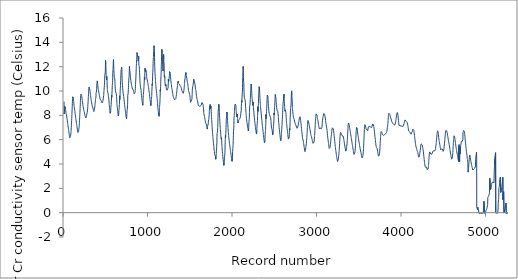
| Category | Series 0 |
|---|---|
| 0.0 | 9.13 |
| 1.0 | 8.11 |
| 2.0 | 8.12 |
| 3.0 | 8.24 |
| 4.0 | 8.34 |
| 5.0 | 8.43 |
| 6.0 | 8.53 |
| 7.0 | 8.64 |
| 8.0 | 8.74 |
| 9.0 | 8.79 |
| 10.0 | 8.8 |
| 11.0 | 8.8 |
| 12.0 | 8.8 |
| 13.0 | 8.81 |
| 14.0 | 8.75 |
| 15.0 | 8.69 |
| 16.0 | 8.62 |
| 17.0 | 8.54 |
| 18.0 | 8.47 |
| 19.0 | 8.41 |
| 20.0 | 8.36 |
| 21.0 | 8.31 |
| 22.0 | 8.27 |
| 23.0 | 8.22 |
| 24.0 | 8.17 |
| 25.0 | 8.13 |
| 26.0 | 8.09 |
| 27.0 | 8.06 |
| 28.0 | 8.04 |
| 29.0 | 8.02 |
| 30.0 | 7.988 |
| 31.0 | 7.944 |
| 32.0 | 7.908 |
| 33.0 | 7.854 |
| 34.0 | 7.809 |
| 35.0 | 7.75 |
| 36.0 | 7.708 |
| 37.0 | 7.666 |
| 38.0 | 7.603 |
| 39.0 | 7.549 |
| 40.0 | 7.488 |
| 41.0 | 7.438 |
| 42.0 | 7.386 |
| 43.0 | 7.335 |
| 44.0 | 7.281 |
| 45.0 | 7.234 |
| 46.0 | 7.182 |
| 47.0 | 7.139 |
| 48.0 | 7.087 |
| 49.0 | 7.037 |
| 50.0 | 6.991 |
| 51.0 | 6.939 |
| 52.0 | 6.896 |
| 53.0 | 6.842 |
| 54.0 | 6.794 |
| 55.0 | 6.744 |
| 56.0 | 6.694 |
| 57.0 | 6.647 |
| 58.0 | 6.595 |
| 59.0 | 6.545 |
| 60.0 | 6.49 |
| 61.0 | 6.443 |
| 62.0 | 6.395 |
| 63.0 | 6.35 |
| 64.0 | 6.312 |
| 65.0 | 6.262 |
| 66.0 | 6.223 |
| 67.0 | 6.186 |
| 68.0 | 6.16 |
| 69.0 | 6.16 |
| 70.0 | 6.172 |
| 71.0 | 6.181 |
| 72.0 | 6.196 |
| 73.0 | 6.212 |
| 74.0 | 6.226 |
| 75.0 | 6.257 |
| 76.0 | 6.282 |
| 77.0 | 6.329 |
| 78.0 | 6.375 |
| 79.0 | 6.409 |
| 80.0 | 6.458 |
| 81.0 | 6.529 |
| 82.0 | 6.588 |
| 83.0 | 6.674 |
| 84.0 | 6.769 |
| 85.0 | 6.883 |
| 86.0 | 7.012 |
| 87.0 | 7.163 |
| 88.0 | 7.299 |
| 89.0 | 7.438 |
| 90.0 | 7.58 |
| 91.0 | 7.737 |
| 92.0 | 7.875 |
| 93.0 | 8.04 |
| 94.0 | 8.2 |
| 95.0 | 8.35 |
| 96.0 | 8.53 |
| 97.0 | 8.75 |
| 98.0 | 8.97 |
| 99.0 | 9.13 |
| 100.0 | 9.18 |
| 101.0 | 9.27 |
| 102.0 | 9.4 |
| 103.0 | 9.52 |
| 104.0 | 9.56 |
| 105.0 | 9.56 |
| 106.0 | 9.56 |
| 107.0 | 9.52 |
| 108.0 | 9.48 |
| 109.0 | 9.43 |
| 110.0 | 9.34 |
| 111.0 | 9.29 |
| 112.0 | 9.21 |
| 113.0 | 9.14 |
| 114.0 | 9.12 |
| 115.0 | 9.07 |
| 116.0 | 8.98 |
| 117.0 | 8.91 |
| 118.0 | 8.84 |
| 119.0 | 8.78 |
| 120.0 | 8.72 |
| 121.0 | 8.67 |
| 122.0 | 8.62 |
| 123.0 | 8.6 |
| 124.0 | 8.55 |
| 125.0 | 8.51 |
| 126.0 | 8.46 |
| 127.0 | 8.4 |
| 128.0 | 8.35 |
| 129.0 | 8.29 |
| 130.0 | 8.22 |
| 131.0 | 8.16 |
| 132.0 | 8.1 |
| 133.0 | 8.05 |
| 134.0 | 8 |
| 135.0 | 7.948 |
| 136.0 | 7.894 |
| 137.0 | 7.843 |
| 138.0 | 7.791 |
| 139.0 | 7.737 |
| 140.0 | 7.689 |
| 141.0 | 7.639 |
| 142.0 | 7.583 |
| 143.0 | 7.539 |
| 144.0 | 7.493 |
| 145.0 | 7.445 |
| 146.0 | 7.396 |
| 147.0 | 7.348 |
| 148.0 | 7.301 |
| 149.0 | 7.252 |
| 150.0 | 7.21 |
| 151.0 | 7.164 |
| 152.0 | 7.117 |
| 153.0 | 7.064 |
| 154.0 | 7.015 |
| 155.0 | 6.964 |
| 156.0 | 6.918 |
| 157.0 | 6.871 |
| 158.0 | 6.824 |
| 159.0 | 6.779 |
| 160.0 | 6.728 |
| 161.0 | 6.687 |
| 162.0 | 6.646 |
| 163.0 | 6.614 |
| 164.0 | 6.591 |
| 165.0 | 6.585 |
| 166.0 | 6.59 |
| 167.0 | 6.611 |
| 168.0 | 6.629 |
| 169.0 | 6.647 |
| 170.0 | 6.665 |
| 171.0 | 6.697 |
| 172.0 | 6.726 |
| 173.0 | 6.765 |
| 174.0 | 6.817 |
| 175.0 | 6.837 |
| 176.0 | 6.905 |
| 177.0 | 6.972 |
| 178.0 | 7.02 |
| 179.0 | 7.103 |
| 180.0 | 7.19 |
| 181.0 | 7.3 |
| 182.0 | 7.421 |
| 183.0 | 7.563 |
| 184.0 | 7.691 |
| 185.0 | 7.826 |
| 186.0 | 7.96 |
| 187.0 | 8.08 |
| 188.0 | 8.21 |
| 189.0 | 8.35 |
| 190.0 | 8.54 |
| 191.0 | 8.72 |
| 192.0 | 8.85 |
| 193.0 | 9.04 |
| 194.0 | 9.22 |
| 195.0 | 9.36 |
| 196.0 | 9.5 |
| 197.0 | 9.56 |
| 198.0 | 9.63 |
| 199.0 | 9.66 |
| 200.0 | 9.74 |
| 201.0 | 9.7 |
| 202.0 | 9.72 |
| 203.0 | 9.73 |
| 204.0 | 9.72 |
| 205.0 | 9.69 |
| 206.0 | 9.68 |
| 207.0 | 9.65 |
| 208.0 | 9.6 |
| 209.0 | 9.57 |
| 210.0 | 9.53 |
| 211.0 | 9.46 |
| 212.0 | 9.41 |
| 213.0 | 9.37 |
| 214.0 | 9.32 |
| 215.0 | 9.26 |
| 216.0 | 9.21 |
| 217.0 | 9.16 |
| 218.0 | 9.11 |
| 219.0 | 9.06 |
| 220.0 | 9.01 |
| 221.0 | 8.95 |
| 222.0 | 8.91 |
| 223.0 | 8.86 |
| 224.0 | 8.82 |
| 225.0 | 8.77 |
| 226.0 | 8.72 |
| 227.0 | 8.68 |
| 228.0 | 8.64 |
| 229.0 | 8.6 |
| 230.0 | 8.56 |
| 231.0 | 8.52 |
| 232.0 | 8.49 |
| 233.0 | 8.45 |
| 234.0 | 8.43 |
| 235.0 | 8.4 |
| 236.0 | 8.37 |
| 237.0 | 8.34 |
| 238.0 | 8.31 |
| 239.0 | 8.28 |
| 240.0 | 8.25 |
| 241.0 | 8.23 |
| 242.0 | 8.2 |
| 243.0 | 8.16 |
| 244.0 | 8.13 |
| 245.0 | 8.1 |
| 246.0 | 8.06 |
| 247.0 | 8.02 |
| 248.0 | 7.99 |
| 249.0 | 7.968 |
| 250.0 | 7.947 |
| 251.0 | 7.91 |
| 252.0 | 7.874 |
| 253.0 | 7.848 |
| 254.0 | 7.821 |
| 255.0 | 7.802 |
| 256.0 | 7.794 |
| 257.0 | 7.782 |
| 258.0 | 7.767 |
| 259.0 | 7.765 |
| 260.0 | 7.771 |
| 261.0 | 7.803 |
| 262.0 | 7.822 |
| 263.0 | 7.839 |
| 264.0 | 7.863 |
| 265.0 | 7.899 |
| 266.0 | 7.945 |
| 267.0 | 7.993 |
| 268.0 | 8.02 |
| 269.0 | 8.06 |
| 270.0 | 8.1 |
| 271.0 | 8.12 |
| 272.0 | 8.18 |
| 273.0 | 8.22 |
| 274.0 | 8.23 |
| 275.0 | 8.24 |
| 276.0 | 8.3 |
| 277.0 | 8.36 |
| 278.0 | 8.38 |
| 279.0 | 8.43 |
| 280.0 | 8.57 |
| 281.0 | 8.73 |
| 282.0 | 8.89 |
| 283.0 | 8.93 |
| 284.0 | 9.02 |
| 285.0 | 9.15 |
| 286.0 | 9.28 |
| 287.0 | 9.44 |
| 288.0 | 9.55 |
| 289.0 | 9.68 |
| 290.0 | 9.8 |
| 291.0 | 9.94 |
| 292.0 | 10.07 |
| 293.0 | 10.15 |
| 294.0 | 10.22 |
| 295.0 | 10.27 |
| 296.0 | 10.3 |
| 297.0 | 10.31 |
| 298.0 | 10.29 |
| 299.0 | 10.26 |
| 300.0 | 10.22 |
| 301.0 | 10.24 |
| 302.0 | 10.27 |
| 303.0 | 10.29 |
| 304.0 | 10.23 |
| 305.0 | 10.17 |
| 306.0 | 10.08 |
| 307.0 | 10 |
| 308.0 | 9.95 |
| 309.0 | 9.89 |
| 310.0 | 9.84 |
| 311.0 | 9.78 |
| 312.0 | 9.72 |
| 313.0 | 9.67 |
| 314.0 | 9.61 |
| 315.0 | 9.56 |
| 316.0 | 9.51 |
| 317.0 | 9.45 |
| 318.0 | 9.4 |
| 319.0 | 9.35 |
| 320.0 | 9.31 |
| 321.0 | 9.26 |
| 322.0 | 9.21 |
| 323.0 | 9.17 |
| 324.0 | 9.12 |
| 325.0 | 9.08 |
| 326.0 | 9.05 |
| 327.0 | 9.01 |
| 328.0 | 8.97 |
| 329.0 | 8.94 |
| 330.0 | 8.9 |
| 331.0 | 8.86 |
| 332.0 | 8.83 |
| 333.0 | 8.79 |
| 334.0 | 8.76 |
| 335.0 | 8.75 |
| 336.0 | 8.73 |
| 337.0 | 8.7 |
| 338.0 | 8.67 |
| 339.0 | 8.65 |
| 340.0 | 8.63 |
| 341.0 | 8.61 |
| 342.0 | 8.59 |
| 343.0 | 8.56 |
| 344.0 | 8.53 |
| 345.0 | 8.5 |
| 346.0 | 8.47 |
| 347.0 | 8.44 |
| 348.0 | 8.4 |
| 349.0 | 8.38 |
| 350.0 | 8.36 |
| 351.0 | 8.34 |
| 352.0 | 8.32 |
| 353.0 | 8.31 |
| 354.0 | 8.29 |
| 355.0 | 8.29 |
| 356.0 | 8.31 |
| 357.0 | 8.37 |
| 358.0 | 8.4 |
| 359.0 | 8.42 |
| 360.0 | 8.49 |
| 361.0 | 8.54 |
| 362.0 | 8.6 |
| 363.0 | 8.67 |
| 364.0 | 8.69 |
| 365.0 | 8.79 |
| 366.0 | 8.84 |
| 367.0 | 8.89 |
| 368.0 | 8.99 |
| 369.0 | 9.08 |
| 370.0 | 9.13 |
| 371.0 | 9.16 |
| 372.0 | 9.23 |
| 373.0 | 9.32 |
| 374.0 | 9.33 |
| 375.0 | 9.34 |
| 376.0 | 9.41 |
| 377.0 | 9.5 |
| 378.0 | 9.61 |
| 379.0 | 9.81 |
| 380.0 | 9.8 |
| 381.0 | 9.9 |
| 382.0 | 9.94 |
| 383.0 | 9.9 |
| 384.0 | 10 |
| 385.0 | 10.09 |
| 386.0 | 10.18 |
| 387.0 | 10.33 |
| 388.0 | 10.48 |
| 389.0 | 10.6 |
| 390.0 | 10.68 |
| 391.0 | 10.71 |
| 392.0 | 10.77 |
| 393.0 | 10.73 |
| 394.0 | 10.83 |
| 395.0 | 10.74 |
| 396.0 | 10.64 |
| 397.0 | 10.62 |
| 398.0 | 10.57 |
| 399.0 | 10.51 |
| 400.0 | 10.45 |
| 401.0 | 10.37 |
| 402.0 | 10.31 |
| 403.0 | 10.24 |
| 404.0 | 10.17 |
| 405.0 | 10.12 |
| 406.0 | 10.08 |
| 407.0 | 10.04 |
| 408.0 | 10.02 |
| 409.0 | 9.98 |
| 410.0 | 9.95 |
| 411.0 | 9.91 |
| 412.0 | 9.88 |
| 413.0 | 9.85 |
| 414.0 | 9.82 |
| 415.0 | 9.78 |
| 416.0 | 9.73 |
| 417.0 | 9.7 |
| 418.0 | 9.66 |
| 419.0 | 9.61 |
| 420.0 | 9.57 |
| 421.0 | 9.54 |
| 422.0 | 9.52 |
| 423.0 | 9.48 |
| 424.0 | 9.43 |
| 425.0 | 9.38 |
| 426.0 | 9.33 |
| 427.0 | 9.32 |
| 428.0 | 9.31 |
| 429.0 | 9.31 |
| 430.0 | 9.3 |
| 431.0 | 9.3 |
| 432.0 | 9.3 |
| 433.0 | 9.29 |
| 434.0 | 9.29 |
| 435.0 | 9.28 |
| 436.0 | 9.26 |
| 437.0 | 9.25 |
| 438.0 | 9.23 |
| 439.0 | 9.2 |
| 440.0 | 9.17 |
| 441.0 | 9.15 |
| 442.0 | 9.15 |
| 443.0 | 9.14 |
| 444.0 | 9.12 |
| 445.0 | 9.09 |
| 446.0 | 9.08 |
| 447.0 | 9.08 |
| 448.0 | 9.07 |
| 449.0 | 9.06 |
| 450.0 | 9.02 |
| 451.0 | 8.99 |
| 452.0 | 9 |
| 453.0 | 9.02 |
| 454.0 | 9.04 |
| 455.0 | 9.09 |
| 456.0 | 9.1 |
| 457.0 | 9.11 |
| 458.0 | 9.13 |
| 459.0 | 9.16 |
| 460.0 | 9.18 |
| 461.0 | 9.21 |
| 462.0 | 9.29 |
| 463.0 | 9.34 |
| 464.0 | 9.43 |
| 465.0 | 9.49 |
| 466.0 | 9.43 |
| 467.0 | 9.44 |
| 468.0 | 9.51 |
| 469.0 | 9.62 |
| 470.0 | 9.74 |
| 471.0 | 9.84 |
| 472.0 | 9.94 |
| 473.0 | 10.06 |
| 474.0 | 10.08 |
| 475.0 | 10.13 |
| 476.0 | 10.31 |
| 477.0 | 10.45 |
| 478.0 | 10.57 |
| 479.0 | 10.67 |
| 480.0 | 10.83 |
| 481.0 | 10.98 |
| 482.0 | 11.25 |
| 483.0 | 11.36 |
| 484.0 | 11.39 |
| 485.0 | 11.41 |
| 486.0 | 11.42 |
| 487.0 | 11.5 |
| 488.0 | 11.57 |
| 489.0 | 11.7 |
| 490.0 | 12.13 |
| 491.0 | 12.51 |
| 492.0 | 12.58 |
| 493.0 | 12.48 |
| 494.0 | 12.25 |
| 495.0 | 12 |
| 496.0 | 11.72 |
| 497.0 | 11.58 |
| 498.0 | 11.39 |
| 499.0 | 11.28 |
| 500.0 | 11.19 |
| 501.0 | 11.14 |
| 502.0 | 11.06 |
| 503.0 | 10.91 |
| 504.0 | 11 |
| 505.0 | 11.21 |
| 506.0 | 11.21 |
| 507.0 | 11.2 |
| 508.0 | 11.1 |
| 509.0 | 10.75 |
| 510.0 | 10.49 |
| 511.0 | 10.32 |
| 512.0 | 10.21 |
| 513.0 | 10.12 |
| 514.0 | 10.03 |
| 515.0 | 9.97 |
| 516.0 | 9.92 |
| 517.0 | 9.86 |
| 518.0 | 9.84 |
| 519.0 | 9.86 |
| 520.0 | 9.87 |
| 521.0 | 9.84 |
| 522.0 | 9.78 |
| 523.0 | 9.71 |
| 524.0 | 9.65 |
| 525.0 | 9.58 |
| 526.0 | 9.52 |
| 527.0 | 9.48 |
| 528.0 | 9.47 |
| 529.0 | 9.42 |
| 530.0 | 9.35 |
| 531.0 | 9.25 |
| 532.0 | 9.18 |
| 533.0 | 9.1 |
| 534.0 | 8.99 |
| 535.0 | 8.89 |
| 536.0 | 8.8 |
| 537.0 | 8.74 |
| 538.0 | 8.67 |
| 539.0 | 8.62 |
| 540.0 | 8.58 |
| 541.0 | 8.5 |
| 542.0 | 8.42 |
| 543.0 | 8.35 |
| 544.0 | 8.27 |
| 545.0 | 8.22 |
| 546.0 | 8.17 |
| 547.0 | 8.16 |
| 548.0 | 8.16 |
| 549.0 | 8.15 |
| 550.0 | 8.19 |
| 551.0 | 8.28 |
| 552.0 | 8.42 |
| 553.0 | 8.54 |
| 554.0 | 8.64 |
| 555.0 | 8.71 |
| 556.0 | 8.75 |
| 557.0 | 8.81 |
| 558.0 | 8.88 |
| 559.0 | 9.11 |
| 560.0 | 9.18 |
| 561.0 | 9.26 |
| 562.0 | 9.63 |
| 563.0 | 9.57 |
| 564.0 | 9.48 |
| 565.0 | 9.54 |
| 566.0 | 9.65 |
| 567.0 | 9.78 |
| 568.0 | 9.93 |
| 569.0 | 10.12 |
| 570.0 | 10.26 |
| 571.0 | 10.45 |
| 572.0 | 10.56 |
| 573.0 | 10.62 |
| 574.0 | 10.7 |
| 575.0 | 10.87 |
| 576.0 | 11.12 |
| 577.0 | 11.49 |
| 578.0 | 11.67 |
| 579.0 | 11.67 |
| 580.0 | 11.77 |
| 581.0 | 11.85 |
| 582.0 | 12.06 |
| 583.0 | 12.33 |
| 584.0 | 12.46 |
| 585.0 | 12.58 |
| 586.0 | 12.46 |
| 587.0 | 12.21 |
| 588.0 | 11.95 |
| 589.0 | 11.78 |
| 590.0 | 11.65 |
| 591.0 | 11.56 |
| 592.0 | 11.44 |
| 593.0 | 11.35 |
| 594.0 | 11.22 |
| 595.0 | 11.08 |
| 596.0 | 11.03 |
| 597.0 | 11.07 |
| 598.0 | 11.07 |
| 599.0 | 11.04 |
| 600.0 | 11.02 |
| 601.0 | 10.99 |
| 602.0 | 10.8 |
| 603.0 | 10.61 |
| 604.0 | 10.47 |
| 605.0 | 10.35 |
| 606.0 | 10.23 |
| 607.0 | 10.15 |
| 608.0 | 10.06 |
| 609.0 | 9.99 |
| 610.0 | 9.92 |
| 611.0 | 9.87 |
| 612.0 | 9.84 |
| 613.0 | 9.92 |
| 614.0 | 9.96 |
| 615.0 | 9.9 |
| 616.0 | 9.85 |
| 617.0 | 9.82 |
| 618.0 | 9.79 |
| 619.0 | 9.75 |
| 620.0 | 9.68 |
| 621.0 | 9.55 |
| 622.0 | 9.44 |
| 623.0 | 9.31 |
| 624.0 | 9.18 |
| 625.0 | 9.07 |
| 626.0 | 8.98 |
| 627.0 | 8.89 |
| 628.0 | 8.8 |
| 629.0 | 8.73 |
| 630.0 | 8.67 |
| 631.0 | 8.61 |
| 632.0 | 8.54 |
| 633.0 | 8.48 |
| 634.0 | 8.42 |
| 635.0 | 8.36 |
| 636.0 | 8.3 |
| 637.0 | 8.24 |
| 638.0 | 8.18 |
| 639.0 | 8.12 |
| 640.0 | 8.06 |
| 641.0 | 8 |
| 642.0 | 7.958 |
| 643.0 | 7.922 |
| 644.0 | 7.882 |
| 645.0 | 7.876 |
| 646.0 | 7.949 |
| 647.0 | 8.1 |
| 648.0 | 8.27 |
| 649.0 | 8.4 |
| 650.0 | 8.46 |
| 651.0 | 8.5 |
| 652.0 | 8.55 |
| 653.0 | 8.65 |
| 654.0 | 8.72 |
| 655.0 | 8.89 |
| 656.0 | 9.01 |
| 657.0 | 9.08 |
| 658.0 | 9.6 |
| 659.0 | 9.44 |
| 660.0 | 9.3 |
| 661.0 | 9.39 |
| 662.0 | 9.47 |
| 663.0 | 9.68 |
| 664.0 | 9.91 |
| 665.0 | 10.06 |
| 666.0 | 10.23 |
| 667.0 | 10.32 |
| 668.0 | 10.45 |
| 669.0 | 10.66 |
| 670.0 | 10.86 |
| 671.0 | 11.04 |
| 672.0 | 11.26 |
| 673.0 | 11.43 |
| 674.0 | 11.55 |
| 675.0 | 11.65 |
| 676.0 | 11.72 |
| 677.0 | 11.77 |
| 678.0 | 11.84 |
| 679.0 | 11.87 |
| 680.0 | 11.92 |
| 681.0 | 11.97 |
| 682.0 | 11.94 |
| 683.0 | 11.86 |
| 684.0 | 11.76 |
| 685.0 | 11.57 |
| 686.0 | 11.3 |
| 687.0 | 11.07 |
| 688.0 | 10.93 |
| 689.0 | 10.8 |
| 690.0 | 10.67 |
| 691.0 | 10.55 |
| 692.0 | 10.42 |
| 693.0 | 10.32 |
| 694.0 | 10.23 |
| 695.0 | 10.15 |
| 696.0 | 10.08 |
| 697.0 | 10.01 |
| 698.0 | 9.93 |
| 699.0 | 9.85 |
| 700.0 | 9.79 |
| 701.0 | 9.74 |
| 702.0 | 9.74 |
| 703.0 | 9.72 |
| 704.0 | 9.67 |
| 705.0 | 9.62 |
| 706.0 | 9.55 |
| 707.0 | 9.48 |
| 708.0 | 9.41 |
| 709.0 | 9.36 |
| 710.0 | 9.29 |
| 711.0 | 9.23 |
| 712.0 | 9.17 |
| 713.0 | 9.09 |
| 714.0 | 9.03 |
| 715.0 | 8.96 |
| 716.0 | 8.89 |
| 717.0 | 8.85 |
| 718.0 | 8.78 |
| 719.0 | 8.72 |
| 720.0 | 8.66 |
| 721.0 | 8.61 |
| 722.0 | 8.57 |
| 723.0 | 8.51 |
| 724.0 | 8.45 |
| 725.0 | 8.4 |
| 726.0 | 8.34 |
| 727.0 | 8.29 |
| 728.0 | 8.23 |
| 729.0 | 8.17 |
| 730.0 | 8.12 |
| 731.0 | 8.08 |
| 732.0 | 8.03 |
| 733.0 | 7.976 |
| 734.0 | 7.924 |
| 735.0 | 7.872 |
| 736.0 | 7.816 |
| 737.0 | 7.778 |
| 738.0 | 7.744 |
| 739.0 | 7.719 |
| 740.0 | 7.751 |
| 741.0 | 7.834 |
| 742.0 | 7.938 |
| 743.0 | 8.07 |
| 744.0 | 8.16 |
| 745.0 | 8.28 |
| 746.0 | 8.37 |
| 747.0 | 8.44 |
| 748.0 | 8.49 |
| 749.0 | 8.54 |
| 750.0 | 8.57 |
| 751.0 | 8.69 |
| 752.0 | 8.87 |
| 753.0 | 9.07 |
| 754.0 | 9.63 |
| 755.0 | 9.71 |
| 756.0 | 9.61 |
| 757.0 | 9.63 |
| 758.0 | 9.69 |
| 759.0 | 9.82 |
| 760.0 | 9.99 |
| 761.0 | 10.14 |
| 762.0 | 10.29 |
| 763.0 | 10.46 |
| 764.0 | 10.63 |
| 765.0 | 10.74 |
| 766.0 | 10.89 |
| 767.0 | 11.03 |
| 768.0 | 11.07 |
| 769.0 | 11.09 |
| 770.0 | 11.22 |
| 771.0 | 11.39 |
| 772.0 | 11.57 |
| 773.0 | 11.74 |
| 774.0 | 12.02 |
| 775.0 | 11.95 |
| 776.0 | 11.7 |
| 777.0 | 11.7 |
| 778.0 | 11.69 |
| 779.0 | 11.64 |
| 780.0 | 11.59 |
| 781.0 | 11.51 |
| 782.0 | 11.43 |
| 783.0 | 11.37 |
| 784.0 | 11.31 |
| 785.0 | 11.21 |
| 786.0 | 11.13 |
| 787.0 | 11.08 |
| 788.0 | 10.98 |
| 789.0 | 10.93 |
| 790.0 | 10.89 |
| 791.0 | 10.84 |
| 792.0 | 10.79 |
| 793.0 | 10.75 |
| 794.0 | 10.72 |
| 795.0 | 10.65 |
| 796.0 | 10.59 |
| 797.0 | 10.55 |
| 798.0 | 10.51 |
| 799.0 | 10.49 |
| 800.0 | 10.46 |
| 801.0 | 10.43 |
| 802.0 | 10.4 |
| 803.0 | 10.36 |
| 804.0 | 10.33 |
| 805.0 | 10.3 |
| 806.0 | 10.26 |
| 807.0 | 10.24 |
| 808.0 | 10.22 |
| 809.0 | 10.21 |
| 810.0 | 10.2 |
| 811.0 | 10.18 |
| 812.0 | 10.16 |
| 813.0 | 10.17 |
| 814.0 | 10.15 |
| 815.0 | 10.14 |
| 816.0 | 10.12 |
| 817.0 | 10.1 |
| 818.0 | 10.1 |
| 819.0 | 10.09 |
| 820.0 | 10.07 |
| 821.0 | 10.03 |
| 822.0 | 9.99 |
| 823.0 | 9.96 |
| 824.0 | 9.92 |
| 825.0 | 9.9 |
| 826.0 | 9.88 |
| 827.0 | 9.86 |
| 828.0 | 9.85 |
| 829.0 | 9.83 |
| 830.0 | 9.8 |
| 831.0 | 9.77 |
| 832.0 | 9.73 |
| 833.0 | 9.69 |
| 834.0 | 9.69 |
| 835.0 | 9.7 |
| 836.0 | 9.73 |
| 837.0 | 9.77 |
| 838.0 | 9.84 |
| 839.0 | 9.87 |
| 840.0 | 9.88 |
| 841.0 | 9.91 |
| 842.0 | 9.96 |
| 843.0 | 10.05 |
| 844.0 | 10.22 |
| 845.0 | 10.35 |
| 846.0 | 10.53 |
| 847.0 | 10.72 |
| 848.0 | 10.75 |
| 849.0 | 10.77 |
| 850.0 | 11.06 |
| 851.0 | 11.31 |
| 852.0 | 11.4 |
| 853.0 | 11.57 |
| 854.0 | 11.83 |
| 855.0 | 12.01 |
| 856.0 | 12.12 |
| 857.0 | 12.26 |
| 858.0 | 12.38 |
| 859.0 | 12.57 |
| 860.0 | 12.63 |
| 861.0 | 12.72 |
| 862.0 | 12.97 |
| 863.0 | 13.15 |
| 864.0 | 13.16 |
| 865.0 | 13.11 |
| 866.0 | 13.21 |
| 867.0 | 13.16 |
| 868.0 | 13.01 |
| 869.0 | 12.96 |
| 870.0 | 12.96 |
| 871.0 | 13.01 |
| 872.0 | 12.95 |
| 873.0 | 12.95 |
| 874.0 | 13 |
| 875.0 | 12.94 |
| 876.0 | 12.72 |
| 877.0 | 12.58 |
| 878.0 | 12.47 |
| 879.0 | 12.57 |
| 880.0 | 12.77 |
| 881.0 | 12.8 |
| 882.0 | 12.83 |
| 883.0 | 12.86 |
| 884.0 | 12.62 |
| 885.0 | 12.31 |
| 886.0 | 12.11 |
| 887.0 | 12.12 |
| 888.0 | 12.13 |
| 889.0 | 12.13 |
| 890.0 | 12.02 |
| 891.0 | 11.88 |
| 892.0 | 11.79 |
| 893.0 | 11.7 |
| 894.0 | 11.51 |
| 895.0 | 11.32 |
| 896.0 | 11.16 |
| 897.0 | 11.01 |
| 898.0 | 10.88 |
| 899.0 | 10.76 |
| 900.0 | 10.67 |
| 901.0 | 10.6 |
| 902.0 | 10.53 |
| 903.0 | 10.46 |
| 904.0 | 10.39 |
| 905.0 | 10.32 |
| 906.0 | 10.26 |
| 907.0 | 10.24 |
| 908.0 | 10.22 |
| 909.0 | 10.21 |
| 910.0 | 10.16 |
| 911.0 | 10.12 |
| 912.0 | 10.05 |
| 913.0 | 9.97 |
| 914.0 | 9.87 |
| 915.0 | 9.78 |
| 916.0 | 9.71 |
| 917.0 | 9.64 |
| 918.0 | 9.58 |
| 919.0 | 9.5 |
| 920.0 | 9.43 |
| 921.0 | 9.36 |
| 922.0 | 9.29 |
| 923.0 | 9.23 |
| 924.0 | 9.18 |
| 925.0 | 9.12 |
| 926.0 | 9.08 |
| 927.0 | 9.03 |
| 928.0 | 8.98 |
| 929.0 | 8.93 |
| 930.0 | 8.88 |
| 931.0 | 8.83 |
| 932.0 | 8.8 |
| 933.0 | 8.82 |
| 934.0 | 8.95 |
| 935.0 | 9.23 |
| 936.0 | 9.39 |
| 937.0 | 9.49 |
| 938.0 | 9.62 |
| 939.0 | 9.72 |
| 940.0 | 9.84 |
| 941.0 | 9.91 |
| 942.0 | 9.95 |
| 943.0 | 10.01 |
| 944.0 | 10.15 |
| 945.0 | 10.25 |
| 946.0 | 10.38 |
| 947.0 | 10.48 |
| 948.0 | 10.6 |
| 949.0 | 10.75 |
| 950.0 | 10.95 |
| 951.0 | 11.13 |
| 952.0 | 11.1 |
| 953.0 | 11.03 |
| 954.0 | 10.92 |
| 955.0 | 11.15 |
| 956.0 | 11.5 |
| 957.0 | 11.61 |
| 958.0 | 11.68 |
| 959.0 | 11.87 |
| 960.0 | 11.86 |
| 961.0 | 11.79 |
| 962.0 | 11.61 |
| 963.0 | 11.56 |
| 964.0 | 11.6 |
| 965.0 | 11.76 |
| 966.0 | 11.84 |
| 967.0 | 11.83 |
| 968.0 | 11.73 |
| 969.0 | 11.7 |
| 970.0 | 11.74 |
| 971.0 | 11.68 |
| 972.0 | 11.58 |
| 973.0 | 11.56 |
| 974.0 | 11.52 |
| 975.0 | 11.44 |
| 976.0 | 11.36 |
| 977.0 | 11.29 |
| 978.0 | 11.19 |
| 979.0 | 11.08 |
| 980.0 | 11.03 |
| 981.0 | 10.99 |
| 982.0 | 10.97 |
| 983.0 | 10.97 |
| 984.0 | 10.94 |
| 985.0 | 10.9 |
| 986.0 | 10.85 |
| 987.0 | 10.81 |
| 988.0 | 10.76 |
| 989.0 | 10.74 |
| 990.0 | 10.7 |
| 991.0 | 10.65 |
| 992.0 | 10.62 |
| 993.0 | 10.59 |
| 994.0 | 10.59 |
| 995.0 | 10.54 |
| 996.0 | 10.47 |
| 997.0 | 10.41 |
| 998.0 | 10.37 |
| 999.0 | 10.36 |
| 1000.0 | 10.32 |
| 1001.0 | 10.26 |
| 1002.0 | 10.19 |
| 1003.0 | 10.12 |
| 1004.0 | 10.05 |
| 1005.0 | 10 |
| 1006.0 | 9.96 |
| 1007.0 | 9.94 |
| 1008.0 | 9.9 |
| 1009.0 | 9.86 |
| 1010.0 | 9.8 |
| 1011.0 | 9.75 |
| 1012.0 | 9.68 |
| 1013.0 | 9.6 |
| 1014.0 | 9.52 |
| 1015.0 | 9.46 |
| 1016.0 | 9.4 |
| 1017.0 | 9.35 |
| 1018.0 | 9.29 |
| 1019.0 | 9.25 |
| 1020.0 | 9.18 |
| 1021.0 | 9.11 |
| 1022.0 | 9.05 |
| 1023.0 | 8.99 |
| 1024.0 | 8.93 |
| 1025.0 | 8.85 |
| 1026.0 | 8.8 |
| 1027.0 | 8.76 |
| 1028.0 | 8.72 |
| 1029.0 | 8.72 |
| 1030.0 | 8.78 |
| 1031.0 | 8.91 |
| 1032.0 | 9.08 |
| 1033.0 | 9.22 |
| 1034.0 | 9.32 |
| 1035.0 | 9.41 |
| 1036.0 | 9.47 |
| 1037.0 | 9.55 |
| 1038.0 | 9.64 |
| 1039.0 | 9.95 |
| 1040.0 | 10.1 |
| 1041.0 | 10.03 |
| 1042.0 | 10.37 |
| 1043.0 | 10.55 |
| 1044.0 | 10.46 |
| 1045.0 | 10.58 |
| 1046.0 | 10.78 |
| 1047.0 | 10.99 |
| 1048.0 | 11.16 |
| 1049.0 | 11.32 |
| 1050.0 | 11.5 |
| 1051.0 | 11.69 |
| 1052.0 | 11.84 |
| 1053.0 | 11.99 |
| 1054.0 | 12.25 |
| 1055.0 | 12.44 |
| 1056.0 | 12.61 |
| 1057.0 | 12.74 |
| 1058.0 | 12.84 |
| 1059.0 | 13.09 |
| 1060.0 | 13.25 |
| 1061.0 | 13.36 |
| 1062.0 | 13.44 |
| 1063.0 | 13.47 |
| 1064.0 | 13.58 |
| 1065.0 | 13.72 |
| 1066.0 | 13.71 |
| 1067.0 | 13.53 |
| 1068.0 | 13.57 |
| 1069.0 | 13.51 |
| 1070.0 | 13.24 |
| 1071.0 | 12.75 |
| 1072.0 | 12.4 |
| 1073.0 | 12.12 |
| 1074.0 | 11.91 |
| 1075.0 | 11.73 |
| 1076.0 | 11.57 |
| 1077.0 | 11.43 |
| 1078.0 | 11.31 |
| 1079.0 | 11.21 |
| 1080.0 | 11.09 |
| 1081.0 | 10.97 |
| 1082.0 | 10.87 |
| 1083.0 | 10.78 |
| 1084.0 | 10.7 |
| 1085.0 | 10.61 |
| 1086.0 | 10.52 |
| 1087.0 | 10.43 |
| 1088.0 | 10.34 |
| 1089.0 | 10.27 |
| 1090.0 | 10.2 |
| 1091.0 | 10.14 |
| 1092.0 | 10.07 |
| 1093.0 | 10 |
| 1094.0 | 9.93 |
| 1095.0 | 9.86 |
| 1096.0 | 9.79 |
| 1097.0 | 9.71 |
| 1098.0 | 9.64 |
| 1099.0 | 9.57 |
| 1100.0 | 9.49 |
| 1101.0 | 9.43 |
| 1102.0 | 9.37 |
| 1103.0 | 9.3 |
| 1104.0 | 9.21 |
| 1105.0 | 9.13 |
| 1106.0 | 9.04 |
| 1107.0 | 8.95 |
| 1108.0 | 8.87 |
| 1109.0 | 8.76 |
| 1110.0 | 8.7 |
| 1111.0 | 8.6 |
| 1112.0 | 8.5 |
| 1113.0 | 8.45 |
| 1114.0 | 8.4 |
| 1115.0 | 8.35 |
| 1116.0 | 8.3 |
| 1117.0 | 8.2 |
| 1118.0 | 8.15 |
| 1119.0 | 8.1 |
| 1120.0 | 8.05 |
| 1121.0 | 8.03 |
| 1122.0 | 8.01 |
| 1123.0 | 7.954 |
| 1124.0 | 7.922 |
| 1125.0 | 7.908 |
| 1126.0 | 7.982 |
| 1127.0 | 8.17 |
| 1128.0 | 8.38 |
| 1129.0 | 8.56 |
| 1130.0 | 8.65 |
| 1131.0 | 8.74 |
| 1132.0 | 8.81 |
| 1133.0 | 8.89 |
| 1134.0 | 8.96 |
| 1135.0 | 9.2 |
| 1136.0 | 9.41 |
| 1137.0 | 9.5 |
| 1138.0 | 9.91 |
| 1139.0 | 10.1 |
| 1140.0 | 9.98 |
| 1141.0 | 10.05 |
| 1142.0 | 10.17 |
| 1143.0 | 10.38 |
| 1144.0 | 10.62 |
| 1145.0 | 10.79 |
| 1146.0 | 10.98 |
| 1147.0 | 11.16 |
| 1148.0 | 11.29 |
| 1149.0 | 11.44 |
| 1150.0 | 11.76 |
| 1151.0 | 12.12 |
| 1152.0 | 12.23 |
| 1153.0 | 12.44 |
| 1154.0 | 12.86 |
| 1155.0 | 12.89 |
| 1156.0 | 13.3 |
| 1157.0 | 13.42 |
| 1158.0 | 13.44 |
| 1159.0 | 13.46 |
| 1160.0 | 13.46 |
| 1161.0 | 13.21 |
| 1162.0 | 13.11 |
| 1163.0 | 13 |
| 1164.0 | 12.79 |
| 1165.0 | 12.58 |
| 1166.0 | 12.4 |
| 1167.0 | 12.19 |
| 1168.0 | 12.02 |
| 1169.0 | 11.87 |
| 1170.0 | 11.77 |
| 1171.0 | 11.69 |
| 1172.0 | 11.65 |
| 1173.0 | 11.83 |
| 1174.0 | 12.57 |
| 1175.0 | 12.63 |
| 1176.0 | 12.61 |
| 1177.0 | 12.88 |
| 1178.0 | 13.01 |
| 1179.0 | 12.93 |
| 1180.0 | 12.63 |
| 1181.0 | 12.39 |
| 1182.0 | 12.35 |
| 1183.0 | 12.31 |
| 1184.0 | 12.21 |
| 1185.0 | 11.83 |
| 1186.0 | 11.38 |
| 1187.0 | 11.19 |
| 1188.0 | 11.25 |
| 1189.0 | 11.28 |
| 1190.0 | 11.31 |
| 1191.0 | 11.31 |
| 1192.0 | 11.28 |
| 1193.0 | 11.06 |
| 1194.0 | 10.78 |
| 1195.0 | 10.65 |
| 1196.0 | 10.58 |
| 1197.0 | 10.52 |
| 1198.0 | 10.47 |
| 1199.0 | 10.47 |
| 1200.0 | 10.43 |
| 1201.0 | 10.48 |
| 1202.0 | 10.57 |
| 1203.0 | 10.52 |
| 1204.0 | 10.55 |
| 1205.0 | 10.61 |
| 1206.0 | 10.61 |
| 1207.0 | 10.52 |
| 1208.0 | 10.39 |
| 1209.0 | 10.29 |
| 1210.0 | 10.22 |
| 1211.0 | 10.18 |
| 1212.0 | 10.18 |
| 1213.0 | 10.17 |
| 1214.0 | 10.16 |
| 1215.0 | 10.13 |
| 1216.0 | 10.12 |
| 1217.0 | 10.1 |
| 1218.0 | 10.06 |
| 1219.0 | 10.01 |
| 1220.0 | 10 |
| 1221.0 | 10.1 |
| 1222.0 | 10.14 |
| 1223.0 | 10.12 |
| 1224.0 | 10.15 |
| 1225.0 | 10.15 |
| 1226.0 | 10.17 |
| 1227.0 | 10.15 |
| 1228.0 | 10.16 |
| 1229.0 | 10.2 |
| 1230.0 | 10.18 |
| 1231.0 | 10.25 |
| 1232.0 | 10.34 |
| 1233.0 | 10.37 |
| 1234.0 | 10.76 |
| 1235.0 | 10.98 |
| 1236.0 | 10.77 |
| 1237.0 | 10.73 |
| 1238.0 | 10.77 |
| 1239.0 | 10.78 |
| 1240.0 | 10.83 |
| 1241.0 | 10.88 |
| 1242.0 | 10.92 |
| 1243.0 | 11.03 |
| 1244.0 | 11.08 |
| 1245.0 | 11.15 |
| 1246.0 | 11.21 |
| 1247.0 | 11.3 |
| 1248.0 | 11.45 |
| 1249.0 | 11.59 |
| 1250.0 | 11.62 |
| 1251.0 | 11.65 |
| 1252.0 | 11.59 |
| 1253.0 | 11.57 |
| 1254.0 | 11.54 |
| 1255.0 | 11.46 |
| 1256.0 | 11.4 |
| 1257.0 | 11.39 |
| 1258.0 | 11.38 |
| 1259.0 | 11.33 |
| 1260.0 | 11.27 |
| 1261.0 | 11.18 |
| 1262.0 | 11.07 |
| 1263.0 | 10.96 |
| 1264.0 | 10.85 |
| 1265.0 | 10.79 |
| 1266.0 | 10.73 |
| 1267.0 | 10.67 |
| 1268.0 | 10.62 |
| 1269.0 | 10.58 |
| 1270.0 | 10.53 |
| 1271.0 | 10.47 |
| 1272.0 | 10.41 |
| 1273.0 | 10.34 |
| 1274.0 | 10.3 |
| 1275.0 | 10.25 |
| 1276.0 | 10.21 |
| 1277.0 | 10.18 |
| 1278.0 | 10.15 |
| 1279.0 | 10.11 |
| 1280.0 | 10.06 |
| 1281.0 | 10.01 |
| 1282.0 | 9.96 |
| 1283.0 | 9.92 |
| 1284.0 | 9.87 |
| 1285.0 | 9.84 |
| 1286.0 | 9.8 |
| 1287.0 | 9.78 |
| 1288.0 | 9.75 |
| 1289.0 | 9.69 |
| 1290.0 | 9.62 |
| 1291.0 | 9.56 |
| 1292.0 | 9.55 |
| 1293.0 | 9.54 |
| 1294.0 | 9.55 |
| 1295.0 | 9.54 |
| 1296.0 | 9.51 |
| 1297.0 | 9.46 |
| 1298.0 | 9.43 |
| 1299.0 | 9.41 |
| 1300.0 | 9.38 |
| 1301.0 | 9.35 |
| 1302.0 | 9.34 |
| 1303.0 | 9.33 |
| 1304.0 | 9.32 |
| 1305.0 | 9.32 |
| 1306.0 | 9.32 |
| 1307.0 | 9.31 |
| 1308.0 | 9.29 |
| 1309.0 | 9.32 |
| 1310.0 | 9.37 |
| 1311.0 | 9.36 |
| 1312.0 | 9.31 |
| 1313.0 | 9.29 |
| 1314.0 | 9.28 |
| 1315.0 | 9.3 |
| 1316.0 | 9.3 |
| 1317.0 | 9.31 |
| 1318.0 | 9.31 |
| 1319.0 | 9.3 |
| 1320.0 | 9.33 |
| 1321.0 | 9.35 |
| 1322.0 | 9.37 |
| 1323.0 | 9.38 |
| 1324.0 | 9.39 |
| 1325.0 | 9.41 |
| 1326.0 | 9.46 |
| 1327.0 | 9.56 |
| 1328.0 | 9.6 |
| 1329.0 | 9.64 |
| 1330.0 | 9.7 |
| 1331.0 | 9.77 |
| 1332.0 | 9.82 |
| 1333.0 | 9.86 |
| 1334.0 | 9.93 |
| 1335.0 | 9.97 |
| 1336.0 | 10.04 |
| 1337.0 | 10.16 |
| 1338.0 | 10.17 |
| 1339.0 | 10.16 |
| 1340.0 | 10.25 |
| 1341.0 | 10.28 |
| 1342.0 | 10.45 |
| 1343.0 | 10.52 |
| 1344.0 | 10.52 |
| 1345.0 | 10.6 |
| 1346.0 | 10.72 |
| 1347.0 | 10.68 |
| 1348.0 | 10.67 |
| 1349.0 | 10.74 |
| 1350.0 | 10.79 |
| 1351.0 | 10.79 |
| 1352.0 | 10.81 |
| 1353.0 | 10.74 |
| 1354.0 | 10.65 |
| 1355.0 | 10.6 |
| 1356.0 | 10.61 |
| 1357.0 | 10.69 |
| 1358.0 | 10.64 |
| 1359.0 | 10.65 |
| 1360.0 | 10.72 |
| 1361.0 | 10.7 |
| 1362.0 | 10.7 |
| 1363.0 | 10.71 |
| 1364.0 | 10.64 |
| 1365.0 | 10.6 |
| 1366.0 | 10.57 |
| 1367.0 | 10.59 |
| 1368.0 | 10.59 |
| 1369.0 | 10.55 |
| 1370.0 | 10.52 |
| 1371.0 | 10.48 |
| 1372.0 | 10.48 |
| 1373.0 | 10.51 |
| 1374.0 | 10.51 |
| 1375.0 | 10.45 |
| 1376.0 | 10.45 |
| 1377.0 | 10.46 |
| 1378.0 | 10.44 |
| 1379.0 | 10.38 |
| 1380.0 | 10.37 |
| 1381.0 | 10.35 |
| 1382.0 | 10.32 |
| 1383.0 | 10.31 |
| 1384.0 | 10.31 |
| 1385.0 | 10.31 |
| 1386.0 | 10.29 |
| 1387.0 | 10.24 |
| 1388.0 | 10.21 |
| 1389.0 | 10.18 |
| 1390.0 | 10.19 |
| 1391.0 | 10.19 |
| 1392.0 | 10.16 |
| 1393.0 | 10.1 |
| 1394.0 | 10.03 |
| 1395.0 | 10 |
| 1396.0 | 10.01 |
| 1397.0 | 10 |
| 1398.0 | 9.99 |
| 1399.0 | 9.96 |
| 1400.0 | 9.96 |
| 1401.0 | 9.95 |
| 1402.0 | 9.92 |
| 1403.0 | 9.95 |
| 1404.0 | 9.97 |
| 1405.0 | 9.94 |
| 1406.0 | 9.9 |
| 1407.0 | 9.88 |
| 1408.0 | 9.86 |
| 1409.0 | 9.84 |
| 1410.0 | 9.81 |
| 1411.0 | 9.8 |
| 1412.0 | 9.81 |
| 1413.0 | 9.84 |
| 1414.0 | 9.86 |
| 1415.0 | 9.89 |
| 1416.0 | 9.93 |
| 1417.0 | 9.96 |
| 1418.0 | 9.99 |
| 1419.0 | 10.07 |
| 1420.0 | 10.15 |
| 1421.0 | 10.25 |
| 1422.0 | 10.33 |
| 1423.0 | 10.38 |
| 1424.0 | 10.52 |
| 1425.0 | 10.58 |
| 1426.0 | 10.61 |
| 1427.0 | 10.72 |
| 1428.0 | 10.9 |
| 1429.0 | 10.97 |
| 1430.0 | 10.93 |
| 1431.0 | 10.94 |
| 1432.0 | 11 |
| 1433.0 | 11.07 |
| 1434.0 | 11.17 |
| 1435.0 | 11.31 |
| 1436.0 | 11.37 |
| 1437.0 | 11.31 |
| 1438.0 | 11.26 |
| 1439.0 | 11.34 |
| 1440.0 | 11.43 |
| 1441.0 | 11.52 |
| 1442.0 | 11.51 |
| 1443.0 | 11.44 |
| 1444.0 | 11.37 |
| 1445.0 | 11.3 |
| 1446.0 | 11.27 |
| 1447.0 | 11.27 |
| 1448.0 | 11.27 |
| 1449.0 | 11.23 |
| 1450.0 | 11.19 |
| 1451.0 | 11.14 |
| 1452.0 | 11.12 |
| 1453.0 | 11.04 |
| 1454.0 | 10.96 |
| 1455.0 | 10.91 |
| 1456.0 | 10.88 |
| 1457.0 | 10.84 |
| 1458.0 | 10.8 |
| 1459.0 | 10.76 |
| 1460.0 | 10.71 |
| 1461.0 | 10.7 |
| 1462.0 | 10.68 |
| 1463.0 | 10.64 |
| 1464.0 | 10.6 |
| 1465.0 | 10.54 |
| 1466.0 | 10.46 |
| 1467.0 | 10.37 |
| 1468.0 | 10.3 |
| 1469.0 | 10.34 |
| 1470.0 | 10.28 |
| 1471.0 | 10.17 |
| 1472.0 | 10.1 |
| 1473.0 | 10.05 |
| 1474.0 | 10 |
| 1475.0 | 9.97 |
| 1476.0 | 9.95 |
| 1477.0 | 9.93 |
| 1478.0 | 9.92 |
| 1479.0 | 9.9 |
| 1480.0 | 9.88 |
| 1481.0 | 9.87 |
| 1482.0 | 9.85 |
| 1483.0 | 9.82 |
| 1484.0 | 9.78 |
| 1485.0 | 9.71 |
| 1486.0 | 9.7 |
| 1487.0 | 9.69 |
| 1488.0 | 9.67 |
| 1489.0 | 9.65 |
| 1490.0 | 9.6 |
| 1491.0 | 9.53 |
| 1492.0 | 9.45 |
| 1493.0 | 9.36 |
| 1494.0 | 9.28 |
| 1495.0 | 9.19 |
| 1496.0 | 9.08 |
| 1497.0 | 9.06 |
| 1498.0 | 9.11 |
| 1499.0 | 9.16 |
| 1500.0 | 9.17 |
| 1501.0 | 9.18 |
| 1502.0 | 9.18 |
| 1503.0 | 9.17 |
| 1504.0 | 9.16 |
| 1505.0 | 9.16 |
| 1506.0 | 9.15 |
| 1507.0 | 9.11 |
| 1508.0 | 9.1 |
| 1509.0 | 9.13 |
| 1510.0 | 9.19 |
| 1511.0 | 9.26 |
| 1512.0 | 9.31 |
| 1513.0 | 9.34 |
| 1514.0 | 9.38 |
| 1515.0 | 9.53 |
| 1516.0 | 9.71 |
| 1517.0 | 9.88 |
| 1518.0 | 10.07 |
| 1519.0 | 10.16 |
| 1520.0 | 10.13 |
| 1521.0 | 10.22 |
| 1522.0 | 10.35 |
| 1523.0 | 10.3 |
| 1524.0 | 10.29 |
| 1525.0 | 10.38 |
| 1526.0 | 10.45 |
| 1527.0 | 10.5 |
| 1528.0 | 10.5 |
| 1529.0 | 10.56 |
| 1530.0 | 10.63 |
| 1531.0 | 10.73 |
| 1532.0 | 10.86 |
| 1533.0 | 10.86 |
| 1534.0 | 10.87 |
| 1535.0 | 10.95 |
| 1536.0 | 11.02 |
| 1537.0 | 11.02 |
| 1538.0 | 10.94 |
| 1539.0 | 10.85 |
| 1540.0 | 10.82 |
| 1541.0 | 10.85 |
| 1542.0 | 10.89 |
| 1543.0 | 10.8 |
| 1544.0 | 10.76 |
| 1545.0 | 10.73 |
| 1546.0 | 10.65 |
| 1547.0 | 10.59 |
| 1548.0 | 10.58 |
| 1549.0 | 10.6 |
| 1550.0 | 10.54 |
| 1551.0 | 10.47 |
| 1552.0 | 10.41 |
| 1553.0 | 10.34 |
| 1554.0 | 10.24 |
| 1555.0 | 10.17 |
| 1556.0 | 10.12 |
| 1557.0 | 10.1 |
| 1558.0 | 10.07 |
| 1559.0 | 10.11 |
| 1560.0 | 10.08 |
| 1561.0 | 10.03 |
| 1562.0 | 9.98 |
| 1563.0 | 9.86 |
| 1564.0 | 9.76 |
| 1565.0 | 9.7 |
| 1566.0 | 9.65 |
| 1567.0 | 9.61 |
| 1568.0 | 9.57 |
| 1569.0 | 9.53 |
| 1570.0 | 9.48 |
| 1571.0 | 9.45 |
| 1572.0 | 9.4 |
| 1573.0 | 9.39 |
| 1574.0 | 9.37 |
| 1575.0 | 9.34 |
| 1576.0 | 9.3 |
| 1577.0 | 9.25 |
| 1578.0 | 9.2 |
| 1579.0 | 9.18 |
| 1580.0 | 9.14 |
| 1581.0 | 9.12 |
| 1582.0 | 9.1 |
| 1583.0 | 9.07 |
| 1584.0 | 9.01 |
| 1585.0 | 8.96 |
| 1586.0 | 8.92 |
| 1587.0 | 8.86 |
| 1588.0 | 8.82 |
| 1589.0 | 8.83 |
| 1590.0 | 8.82 |
| 1591.0 | 8.82 |
| 1592.0 | 8.81 |
| 1593.0 | 8.79 |
| 1594.0 | 8.79 |
| 1595.0 | 8.78 |
| 1596.0 | 8.77 |
| 1597.0 | 8.76 |
| 1598.0 | 8.75 |
| 1599.0 | 8.74 |
| 1600.0 | 8.74 |
| 1601.0 | 8.72 |
| 1602.0 | 8.72 |
| 1603.0 | 8.71 |
| 1604.0 | 8.71 |
| 1605.0 | 8.7 |
| 1606.0 | 8.7 |
| 1607.0 | 8.71 |
| 1608.0 | 8.73 |
| 1609.0 | 8.73 |
| 1610.0 | 8.76 |
| 1611.0 | 8.77 |
| 1612.0 | 8.77 |
| 1613.0 | 8.8 |
| 1614.0 | 8.81 |
| 1615.0 | 8.81 |
| 1616.0 | 8.78 |
| 1617.0 | 8.76 |
| 1618.0 | 8.77 |
| 1619.0 | 8.79 |
| 1620.0 | 8.79 |
| 1621.0 | 8.77 |
| 1622.0 | 8.78 |
| 1623.0 | 8.8 |
| 1624.0 | 8.84 |
| 1625.0 | 8.88 |
| 1626.0 | 8.9 |
| 1627.0 | 8.93 |
| 1628.0 | 8.96 |
| 1629.0 | 8.98 |
| 1630.0 | 9 |
| 1631.0 | 9.01 |
| 1632.0 | 9.05 |
| 1633.0 | 9.05 |
| 1634.0 | 9.08 |
| 1635.0 | 9.09 |
| 1636.0 | 9.08 |
| 1637.0 | 9.09 |
| 1638.0 | 9.07 |
| 1639.0 | 9.07 |
| 1640.0 | 9.06 |
| 1641.0 | 9.03 |
| 1642.0 | 9 |
| 1643.0 | 8.98 |
| 1644.0 | 8.92 |
| 1645.0 | 8.88 |
| 1646.0 | 8.84 |
| 1647.0 | 8.8 |
| 1648.0 | 8.71 |
| 1649.0 | 8.66 |
| 1650.0 | 8.61 |
| 1651.0 | 8.56 |
| 1652.0 | 8.44 |
| 1653.0 | 8.23 |
| 1654.0 | 8.14 |
| 1655.0 | 8.15 |
| 1656.0 | 8.19 |
| 1657.0 | 8.17 |
| 1658.0 | 8.14 |
| 1659.0 | 8.14 |
| 1660.0 | 8.12 |
| 1661.0 | 8.08 |
| 1662.0 | 7.924 |
| 1663.0 | 7.856 |
| 1664.0 | 7.825 |
| 1665.0 | 7.763 |
| 1666.0 | 7.75 |
| 1667.0 | 7.806 |
| 1668.0 | 7.681 |
| 1669.0 | 7.627 |
| 1670.0 | 7.612 |
| 1671.0 | 7.548 |
| 1672.0 | 7.49 |
| 1673.0 | 7.47 |
| 1674.0 | 7.385 |
| 1675.0 | 7.369 |
| 1676.0 | 7.429 |
| 1677.0 | 7.451 |
| 1678.0 | 7.453 |
| 1679.0 | 7.433 |
| 1680.0 | 7.414 |
| 1681.0 | 7.296 |
| 1682.0 | 7.317 |
| 1683.0 | 7.344 |
| 1684.0 | 7.337 |
| 1685.0 | 7.323 |
| 1686.0 | 7.312 |
| 1687.0 | 7.207 |
| 1688.0 | 7.08 |
| 1689.0 | 7.066 |
| 1690.0 | 7.046 |
| 1691.0 | 6.976 |
| 1692.0 | 6.918 |
| 1693.0 | 6.919 |
| 1694.0 | 6.909 |
| 1695.0 | 6.87 |
| 1696.0 | 6.889 |
| 1697.0 | 6.979 |
| 1698.0 | 7.081 |
| 1699.0 | 7.115 |
| 1700.0 | 7.105 |
| 1701.0 | 7.091 |
| 1702.0 | 7.068 |
| 1703.0 | 7.132 |
| 1704.0 | 7.147 |
| 1705.0 | 7.163 |
| 1706.0 | 7.287 |
| 1707.0 | 7.433 |
| 1708.0 | 7.527 |
| 1709.0 | 7.531 |
| 1710.0 | 7.475 |
| 1711.0 | 7.47 |
| 1712.0 | 7.517 |
| 1713.0 | 7.654 |
| 1714.0 | 7.767 |
| 1715.0 | 7.855 |
| 1716.0 | 7.877 |
| 1717.0 | 7.928 |
| 1718.0 | 8.05 |
| 1719.0 | 8.3 |
| 1720.0 | 8.28 |
| 1721.0 | 8.42 |
| 1722.0 | 8.5 |
| 1723.0 | 8.48 |
| 1724.0 | 8.5 |
| 1725.0 | 8.72 |
| 1726.0 | 8.7 |
| 1727.0 | 8.57 |
| 1728.0 | 8.71 |
| 1729.0 | 8.89 |
| 1730.0 | 8.79 |
| 1731.0 | 8.75 |
| 1732.0 | 8.71 |
| 1733.0 | 8.55 |
| 1734.0 | 8.63 |
| 1735.0 | 8.68 |
| 1736.0 | 8.78 |
| 1737.0 | 8.83 |
| 1738.0 | 8.74 |
| 1739.0 | 8.74 |
| 1740.0 | 8.65 |
| 1741.0 | 8.48 |
| 1742.0 | 8.32 |
| 1743.0 | 8.18 |
| 1744.0 | 8.05 |
| 1745.0 | 7.919 |
| 1746.0 | 7.798 |
| 1747.0 | 7.654 |
| 1748.0 | 7.546 |
| 1749.0 | 7.429 |
| 1750.0 | 7.307 |
| 1751.0 | 7.197 |
| 1752.0 | 7.096 |
| 1753.0 | 6.971 |
| 1754.0 | 6.867 |
| 1755.0 | 6.818 |
| 1756.0 | 6.709 |
| 1757.0 | 6.582 |
| 1758.0 | 6.504 |
| 1759.0 | 6.423 |
| 1760.0 | 6.358 |
| 1761.0 | 6.267 |
| 1762.0 | 6.167 |
| 1763.0 | 6.091 |
| 1764.0 | 6.005 |
| 1765.0 | 5.953 |
| 1766.0 | 5.894 |
| 1767.0 | 5.843 |
| 1768.0 | 5.749 |
| 1769.0 | 5.661 |
| 1770.0 | 5.607 |
| 1771.0 | 5.553 |
| 1772.0 | 5.474 |
| 1773.0 | 5.42 |
| 1774.0 | 5.346 |
| 1775.0 | 5.261 |
| 1776.0 | 5.189 |
| 1777.0 | 5.122 |
| 1778.0 | 5.068 |
| 1779.0 | 5.036 |
| 1780.0 | 4.974 |
| 1781.0 | 4.868 |
| 1782.0 | 4.782 |
| 1783.0 | 4.778 |
| 1784.0 | 4.752 |
| 1785.0 | 4.712 |
| 1786.0 | 4.719 |
| 1787.0 | 4.756 |
| 1788.0 | 4.756 |
| 1789.0 | 4.737 |
| 1790.0 | 4.706 |
| 1791.0 | 4.653 |
| 1792.0 | 4.597 |
| 1793.0 | 4.489 |
| 1794.0 | 4.411 |
| 1795.0 | 4.391 |
| 1796.0 | 4.426 |
| 1797.0 | 4.448 |
| 1798.0 | 4.433 |
| 1799.0 | 4.512 |
| 1800.0 | 4.706 |
| 1801.0 | 4.843 |
| 1802.0 | 4.99 |
| 1803.0 | 5.085 |
| 1804.0 | 5.129 |
| 1805.0 | 5.249 |
| 1806.0 | 5.416 |
| 1807.0 | 5.557 |
| 1808.0 | 5.639 |
| 1809.0 | 5.744 |
| 1810.0 | 6.23 |
| 1811.0 | 6.508 |
| 1812.0 | 6.427 |
| 1813.0 | 6.467 |
| 1814.0 | 6.567 |
| 1815.0 | 6.602 |
| 1816.0 | 6.734 |
| 1817.0 | 6.883 |
| 1818.0 | 6.994 |
| 1819.0 | 7.114 |
| 1820.0 | 7.301 |
| 1821.0 | 7.603 |
| 1822.0 | 7.835 |
| 1823.0 | 8.03 |
| 1824.0 | 8.2 |
| 1825.0 | 8.34 |
| 1826.0 | 8.42 |
| 1827.0 | 8.52 |
| 1828.0 | 8.64 |
| 1829.0 | 8.77 |
| 1830.0 | 8.83 |
| 1831.0 | 8.9 |
| 1832.0 | 8.92 |
| 1833.0 | 8.86 |
| 1834.0 | 8.84 |
| 1835.0 | 8.71 |
| 1836.0 | 8.52 |
| 1837.0 | 8.34 |
| 1838.0 | 8.24 |
| 1839.0 | 8.1 |
| 1840.0 | 7.959 |
| 1841.0 | 7.845 |
| 1842.0 | 7.758 |
| 1843.0 | 7.618 |
| 1844.0 | 7.488 |
| 1845.0 | 7.378 |
| 1846.0 | 7.239 |
| 1847.0 | 7.12 |
| 1848.0 | 7.029 |
| 1849.0 | 6.926 |
| 1850.0 | 6.817 |
| 1851.0 | 6.708 |
| 1852.0 | 6.647 |
| 1853.0 | 6.598 |
| 1854.0 | 6.523 |
| 1855.0 | 6.406 |
| 1856.0 | 6.325 |
| 1857.0 | 6.336 |
| 1858.0 | 6.145 |
| 1859.0 | 6.11 |
| 1860.0 | 6.117 |
| 1861.0 | 6.042 |
| 1862.0 | 6.109 |
| 1863.0 | 6.153 |
| 1864.0 | 6.08 |
| 1865.0 | 5.947 |
| 1866.0 | 5.789 |
| 1867.0 | 5.651 |
| 1868.0 | 5.537 |
| 1869.0 | 5.44 |
| 1870.0 | 5.335 |
| 1871.0 | 5.235 |
| 1872.0 | 5.148 |
| 1873.0 | 5.087 |
| 1874.0 | 5.021 |
| 1875.0 | 4.96 |
| 1876.0 | 4.869 |
| 1877.0 | 4.779 |
| 1878.0 | 4.699 |
| 1879.0 | 4.609 |
| 1880.0 | 4.532 |
| 1881.0 | 4.494 |
| 1882.0 | 4.435 |
| 1883.0 | 4.373 |
| 1884.0 | 4.329 |
| 1885.0 | 4.22 |
| 1886.0 | 4.149 |
| 1887.0 | 4.107 |
| 1888.0 | 4.045 |
| 1889.0 | 3.984 |
| 1890.0 | 3.927 |
| 1891.0 | 3.888 |
| 1892.0 | 3.9 |
| 1893.0 | 3.898 |
| 1894.0 | 3.928 |
| 1895.0 | 4.043 |
| 1896.0 | 4.239 |
| 1897.0 | 4.412 |
| 1898.0 | 4.559 |
| 1899.0 | 4.601 |
| 1900.0 | 4.623 |
| 1901.0 | 4.671 |
| 1902.0 | 4.739 |
| 1903.0 | 4.864 |
| 1904.0 | 4.974 |
| 1905.0 | 5.14 |
| 1906.0 | 5.569 |
| 1907.0 | 5.868 |
| 1908.0 | 6.02 |
| 1909.0 | 6.224 |
| 1910.0 | 6.351 |
| 1911.0 | 6.186 |
| 1912.0 | 6.187 |
| 1913.0 | 6.328 |
| 1914.0 | 6.495 |
| 1915.0 | 6.629 |
| 1916.0 | 6.8 |
| 1917.0 | 6.986 |
| 1918.0 | 7.249 |
| 1919.0 | 7.465 |
| 1920.0 | 7.641 |
| 1921.0 | 7.749 |
| 1922.0 | 7.824 |
| 1923.0 | 7.911 |
| 1924.0 | 8.02 |
| 1925.0 | 8.13 |
| 1926.0 | 8.21 |
| 1927.0 | 8.27 |
| 1928.0 | 8.3 |
| 1929.0 | 8.28 |
| 1930.0 | 8.22 |
| 1931.0 | 8.11 |
| 1932.0 | 7.946 |
| 1933.0 | 7.818 |
| 1934.0 | 7.692 |
| 1935.0 | 7.571 |
| 1936.0 | 7.46 |
| 1937.0 | 7.341 |
| 1938.0 | 7.233 |
| 1939.0 | 7.114 |
| 1940.0 | 7.01 |
| 1941.0 | 6.912 |
| 1942.0 | 6.795 |
| 1943.0 | 6.687 |
| 1944.0 | 6.601 |
| 1945.0 | 6.532 |
| 1946.0 | 6.471 |
| 1947.0 | 6.408 |
| 1948.0 | 6.331 |
| 1949.0 | 6.228 |
| 1950.0 | 6.145 |
| 1951.0 | 6.108 |
| 1952.0 | 6.061 |
| 1953.0 | 6.003 |
| 1954.0 | 5.946 |
| 1955.0 | 5.878 |
| 1956.0 | 5.826 |
| 1957.0 | 5.761 |
| 1958.0 | 5.693 |
| 1959.0 | 5.642 |
| 1960.0 | 5.584 |
| 1961.0 | 5.546 |
| 1962.0 | 5.509 |
| 1963.0 | 5.429 |
| 1964.0 | 5.38 |
| 1965.0 | 5.331 |
| 1966.0 | 5.276 |
| 1967.0 | 5.202 |
| 1968.0 | 5.186 |
| 1969.0 | 5.101 |
| 1970.0 | 5.052 |
| 1971.0 | 5.015 |
| 1972.0 | 4.973 |
| 1973.0 | 4.923 |
| 1974.0 | 4.852 |
| 1975.0 | 4.809 |
| 1976.0 | 4.757 |
| 1977.0 | 4.689 |
| 1978.0 | 4.65 |
| 1979.0 | 4.613 |
| 1980.0 | 4.563 |
| 1981.0 | 4.525 |
| 1982.0 | 4.492 |
| 1983.0 | 4.44 |
| 1984.0 | 4.384 |
| 1985.0 | 4.318 |
| 1986.0 | 4.283 |
| 1987.0 | 4.241 |
| 1988.0 | 4.221 |
| 1989.0 | 4.22 |
| 1990.0 | 4.216 |
| 1991.0 | 4.262 |
| 1992.0 | 4.437 |
| 1993.0 | 4.649 |
| 1994.0 | 4.825 |
| 1995.0 | 5.012 |
| 1996.0 | 5.157 |
| 1997.0 | 5.248 |
| 1998.0 | 5.341 |
| 1999.0 | 5.413 |
| 2000.0 | 5.507 |
| 2001.0 | 5.632 |
| 2002.0 | 5.945 |
| 2003.0 | 6.145 |
| 2004.0 | 6.315 |
| 2005.0 | 6.664 |
| 2006.0 | 6.713 |
| 2007.0 | 6.639 |
| 2008.0 | 6.743 |
| 2009.0 | 6.942 |
| 2010.0 | 7.263 |
| 2011.0 | 7.59 |
| 2012.0 | 7.832 |
| 2013.0 | 7.907 |
| 2014.0 | 7.975 |
| 2015.0 | 8.03 |
| 2016.0 | 8.15 |
| 2017.0 | 8.3 |
| 2018.0 | 8.42 |
| 2019.0 | 8.64 |
| 2020.0 | 8.78 |
| 2021.0 | 8.81 |
| 2022.0 | 8.77 |
| 2023.0 | 8.81 |
| 2024.0 | 8.86 |
| 2025.0 | 8.86 |
| 2026.0 | 8.92 |
| 2027.0 | 8.97 |
| 2028.0 | 8.94 |
| 2029.0 | 8.91 |
| 2030.0 | 8.89 |
| 2031.0 | 8.87 |
| 2032.0 | 8.84 |
| 2033.0 | 8.8 |
| 2034.0 | 8.73 |
| 2035.0 | 8.61 |
| 2036.0 | 8.49 |
| 2037.0 | 8.39 |
| 2038.0 | 8.3 |
| 2039.0 | 8.21 |
| 2040.0 | 8.12 |
| 2041.0 | 8.04 |
| 2042.0 | 7.962 |
| 2043.0 | 7.875 |
| 2044.0 | 7.832 |
| 2045.0 | 7.88 |
| 2046.0 | 7.949 |
| 2047.0 | 8.01 |
| 2048.0 | 8.05 |
| 2049.0 | 8.11 |
| 2050.0 | 8.08 |
| 2051.0 | 7.967 |
| 2052.0 | 7.843 |
| 2053.0 | 7.734 |
| 2054.0 | 7.634 |
| 2055.0 | 7.54 |
| 2056.0 | 7.458 |
| 2057.0 | 7.372 |
| 2058.0 | 7.312 |
| 2059.0 | 7.291 |
| 2060.0 | 7.345 |
| 2061.0 | 7.397 |
| 2062.0 | 7.459 |
| 2063.0 | 7.51 |
| 2064.0 | 7.531 |
| 2065.0 | 7.55 |
| 2066.0 | 7.574 |
| 2067.0 | 7.603 |
| 2068.0 | 7.642 |
| 2069.0 | 7.669 |
| 2070.0 | 7.681 |
| 2071.0 | 7.697 |
| 2072.0 | 7.707 |
| 2073.0 | 7.712 |
| 2074.0 | 7.716 |
| 2075.0 | 7.712 |
| 2076.0 | 7.703 |
| 2077.0 | 7.714 |
| 2078.0 | 7.717 |
| 2079.0 | 7.718 |
| 2080.0 | 7.721 |
| 2081.0 | 7.723 |
| 2082.0 | 7.721 |
| 2083.0 | 7.719 |
| 2084.0 | 7.727 |
| 2085.0 | 7.753 |
| 2086.0 | 7.754 |
| 2087.0 | 7.783 |
| 2088.0 | 7.894 |
| 2089.0 | 7.894 |
| 2090.0 | 7.899 |
| 2091.0 | 8.04 |
| 2092.0 | 8.17 |
| 2093.0 | 8.25 |
| 2094.0 | 8.27 |
| 2095.0 | 8.28 |
| 2096.0 | 8.32 |
| 2097.0 | 8.42 |
| 2098.0 | 8.74 |
| 2099.0 | 8.85 |
| 2100.0 | 8.95 |
| 2101.0 | 9.02 |
| 2102.0 | 9.17 |
| 2103.0 | 9.08 |
| 2104.0 | 9.14 |
| 2105.0 | 9.27 |
| 2106.0 | 9.43 |
| 2107.0 | 9.58 |
| 2108.0 | 9.67 |
| 2109.0 | 9.75 |
| 2110.0 | 9.88 |
| 2111.0 | 10 |
| 2112.0 | 10.29 |
| 2113.0 | 10.59 |
| 2114.0 | 11 |
| 2115.0 | 11.19 |
| 2116.0 | 11.4 |
| 2117.0 | 11.62 |
| 2118.0 | 11.79 |
| 2119.0 | 11.92 |
| 2120.0 | 12.02 |
| 2121.0 | 11.82 |
| 2122.0 | 11.5 |
| 2123.0 | 11.28 |
| 2124.0 | 11.11 |
| 2125.0 | 10.81 |
| 2126.0 | 10.74 |
| 2127.0 | 10.72 |
| 2128.0 | 10.42 |
| 2129.0 | 10.12 |
| 2130.0 | 9.9 |
| 2131.0 | 9.74 |
| 2132.0 | 9.59 |
| 2133.0 | 9.5 |
| 2134.0 | 9.42 |
| 2135.0 | 9.38 |
| 2136.0 | 9.43 |
| 2137.0 | 9.38 |
| 2138.0 | 9.34 |
| 2139.0 | 9.39 |
| 2140.0 | 9.4 |
| 2141.0 | 9.34 |
| 2142.0 | 9.28 |
| 2143.0 | 9.25 |
| 2144.0 | 9.23 |
| 2145.0 | 9.22 |
| 2146.0 | 9.06 |
| 2147.0 | 8.85 |
| 2148.0 | 8.7 |
| 2149.0 | 8.65 |
| 2150.0 | 8.56 |
| 2151.0 | 8.44 |
| 2152.0 | 8.34 |
| 2153.0 | 8.25 |
| 2154.0 | 8.16 |
| 2155.0 | 8.07 |
| 2156.0 | 7.983 |
| 2157.0 | 7.891 |
| 2158.0 | 7.815 |
| 2159.0 | 7.731 |
| 2160.0 | 7.671 |
| 2161.0 | 7.621 |
| 2162.0 | 7.561 |
| 2163.0 | 7.491 |
| 2164.0 | 7.435 |
| 2165.0 | 7.389 |
| 2166.0 | 7.338 |
| 2167.0 | 7.295 |
| 2168.0 | 7.251 |
| 2169.0 | 7.196 |
| 2170.0 | 7.155 |
| 2171.0 | 7.109 |
| 2172.0 | 7.074 |
| 2173.0 | 7.026 |
| 2174.0 | 6.988 |
| 2175.0 | 6.964 |
| 2176.0 | 6.917 |
| 2177.0 | 6.859 |
| 2178.0 | 6.8 |
| 2179.0 | 6.749 |
| 2180.0 | 6.723 |
| 2181.0 | 6.713 |
| 2182.0 | 6.735 |
| 2183.0 | 6.778 |
| 2184.0 | 6.868 |
| 2185.0 | 6.978 |
| 2186.0 | 7.114 |
| 2187.0 | 7.28 |
| 2188.0 | 7.429 |
| 2189.0 | 7.513 |
| 2190.0 | 7.583 |
| 2191.0 | 7.649 |
| 2192.0 | 7.72 |
| 2193.0 | 7.843 |
| 2194.0 | 8.23 |
| 2195.0 | 8.34 |
| 2196.0 | 8.41 |
| 2197.0 | 8.75 |
| 2198.0 | 8.79 |
| 2199.0 | 8.68 |
| 2200.0 | 8.75 |
| 2201.0 | 8.92 |
| 2202.0 | 9.09 |
| 2203.0 | 9.18 |
| 2204.0 | 9.3 |
| 2205.0 | 9.4 |
| 2206.0 | 9.49 |
| 2207.0 | 9.66 |
| 2208.0 | 9.81 |
| 2209.0 | 9.98 |
| 2210.0 | 10.14 |
| 2211.0 | 10.25 |
| 2212.0 | 10.43 |
| 2213.0 | 10.56 |
| 2214.0 | 10.58 |
| 2215.0 | 10.58 |
| 2216.0 | 10.55 |
| 2217.0 | 10.52 |
| 2218.0 | 10.4 |
| 2219.0 | 10.23 |
| 2220.0 | 10.04 |
| 2221.0 | 9.9 |
| 2222.0 | 9.78 |
| 2223.0 | 9.65 |
| 2224.0 | 9.54 |
| 2225.0 | 9.45 |
| 2226.0 | 9.36 |
| 2227.0 | 9.27 |
| 2228.0 | 9.19 |
| 2229.0 | 9.1 |
| 2230.0 | 9.03 |
| 2231.0 | 8.96 |
| 2232.0 | 8.9 |
| 2233.0 | 8.83 |
| 2234.0 | 8.78 |
| 2235.0 | 8.78 |
| 2236.0 | 8.95 |
| 2237.0 | 9.1 |
| 2238.0 | 9.05 |
| 2239.0 | 8.9 |
| 2240.0 | 8.76 |
| 2241.0 | 8.64 |
| 2242.0 | 8.57 |
| 2243.0 | 8.52 |
| 2244.0 | 8.45 |
| 2245.0 | 8.37 |
| 2246.0 | 8.26 |
| 2247.0 | 8.17 |
| 2248.0 | 8.09 |
| 2249.0 | 8.03 |
| 2250.0 | 7.941 |
| 2251.0 | 7.88 |
| 2252.0 | 7.823 |
| 2253.0 | 7.762 |
| 2254.0 | 7.703 |
| 2255.0 | 7.632 |
| 2256.0 | 7.557 |
| 2257.0 | 7.493 |
| 2258.0 | 7.44 |
| 2259.0 | 7.378 |
| 2260.0 | 7.321 |
| 2261.0 | 7.253 |
| 2262.0 | 7.19 |
| 2263.0 | 7.139 |
| 2264.0 | 7.097 |
| 2265.0 | 7.038 |
| 2266.0 | 6.99 |
| 2267.0 | 6.936 |
| 2268.0 | 6.872 |
| 2269.0 | 6.815 |
| 2270.0 | 6.763 |
| 2271.0 | 6.712 |
| 2272.0 | 6.652 |
| 2273.0 | 6.588 |
| 2274.0 | 6.553 |
| 2275.0 | 6.521 |
| 2276.0 | 6.472 |
| 2277.0 | 6.46 |
| 2278.0 | 6.461 |
| 2279.0 | 6.477 |
| 2280.0 | 6.522 |
| 2281.0 | 6.695 |
| 2282.0 | 6.904 |
| 2283.0 | 7.074 |
| 2284.0 | 7.192 |
| 2285.0 | 7.27 |
| 2286.0 | 7.321 |
| 2287.0 | 7.385 |
| 2288.0 | 7.457 |
| 2289.0 | 7.573 |
| 2290.0 | 7.901 |
| 2291.0 | 7.995 |
| 2292.0 | 8.1 |
| 2293.0 | 8.71 |
| 2294.0 | 8.49 |
| 2295.0 | 8.32 |
| 2296.0 | 8.38 |
| 2297.0 | 8.51 |
| 2298.0 | 8.66 |
| 2299.0 | 8.82 |
| 2300.0 | 8.98 |
| 2301.0 | 9.17 |
| 2302.0 | 9.36 |
| 2303.0 | 9.51 |
| 2304.0 | 9.71 |
| 2305.0 | 9.88 |
| 2306.0 | 10.02 |
| 2307.0 | 10.13 |
| 2308.0 | 10.24 |
| 2309.0 | 10.35 |
| 2310.0 | 10.4 |
| 2311.0 | 10.41 |
| 2312.0 | 10.38 |
| 2313.0 | 10.27 |
| 2314.0 | 10.11 |
| 2315.0 | 9.89 |
| 2316.0 | 9.74 |
| 2317.0 | 9.6 |
| 2318.0 | 9.47 |
| 2319.0 | 9.36 |
| 2320.0 | 9.23 |
| 2321.0 | 9.11 |
| 2322.0 | 9 |
| 2323.0 | 8.9 |
| 2324.0 | 8.81 |
| 2325.0 | 8.72 |
| 2326.0 | 8.64 |
| 2327.0 | 8.56 |
| 2328.0 | 8.48 |
| 2329.0 | 8.41 |
| 2330.0 | 8.35 |
| 2331.0 | 8.28 |
| 2332.0 | 8.21 |
| 2333.0 | 8.16 |
| 2334.0 | 8.09 |
| 2335.0 | 8.01 |
| 2336.0 | 7.95 |
| 2337.0 | 7.864 |
| 2338.0 | 7.786 |
| 2339.0 | 7.719 |
| 2340.0 | 7.649 |
| 2341.0 | 7.579 |
| 2342.0 | 7.498 |
| 2343.0 | 7.438 |
| 2344.0 | 7.383 |
| 2345.0 | 7.306 |
| 2346.0 | 7.253 |
| 2347.0 | 7.182 |
| 2348.0 | 7.117 |
| 2349.0 | 7.065 |
| 2350.0 | 7.005 |
| 2351.0 | 6.94 |
| 2352.0 | 6.866 |
| 2353.0 | 6.789 |
| 2354.0 | 6.721 |
| 2355.0 | 6.677 |
| 2356.0 | 6.627 |
| 2357.0 | 6.56 |
| 2358.0 | 6.481 |
| 2359.0 | 6.417 |
| 2360.0 | 6.365 |
| 2361.0 | 6.318 |
| 2362.0 | 6.255 |
| 2363.0 | 6.207 |
| 2364.0 | 6.149 |
| 2365.0 | 6.085 |
| 2366.0 | 6.01 |
| 2367.0 | 5.962 |
| 2368.0 | 5.916 |
| 2369.0 | 5.868 |
| 2370.0 | 5.8 |
| 2371.0 | 5.753 |
| 2372.0 | 5.719 |
| 2373.0 | 5.69 |
| 2374.0 | 5.677 |
| 2375.0 | 5.676 |
| 2376.0 | 5.729 |
| 2377.0 | 5.878 |
| 2378.0 | 6.095 |
| 2379.0 | 6.285 |
| 2380.0 | 6.415 |
| 2381.0 | 6.519 |
| 2382.0 | 6.587 |
| 2383.0 | 6.67 |
| 2384.0 | 6.759 |
| 2385.0 | 6.86 |
| 2386.0 | 7.069 |
| 2387.0 | 7.204 |
| 2388.0 | 7.312 |
| 2389.0 | 8.06 |
| 2390.0 | 7.896 |
| 2391.0 | 7.732 |
| 2392.0 | 7.823 |
| 2393.0 | 7.993 |
| 2394.0 | 8.14 |
| 2395.0 | 8.2 |
| 2396.0 | 8.3 |
| 2397.0 | 8.43 |
| 2398.0 | 8.55 |
| 2399.0 | 8.7 |
| 2400.0 | 8.86 |
| 2401.0 | 9 |
| 2402.0 | 9.17 |
| 2403.0 | 9.29 |
| 2404.0 | 9.44 |
| 2405.0 | 9.57 |
| 2406.0 | 9.66 |
| 2407.0 | 9.71 |
| 2408.0 | 9.67 |
| 2409.0 | 9.63 |
| 2410.0 | 9.58 |
| 2411.0 | 9.52 |
| 2412.0 | 9.46 |
| 2413.0 | 9.42 |
| 2414.0 | 9.33 |
| 2415.0 | 9.22 |
| 2416.0 | 9.09 |
| 2417.0 | 8.96 |
| 2418.0 | 8.83 |
| 2419.0 | 8.73 |
| 2420.0 | 8.65 |
| 2421.0 | 8.59 |
| 2422.0 | 8.51 |
| 2423.0 | 8.43 |
| 2424.0 | 8.36 |
| 2425.0 | 8.28 |
| 2426.0 | 8.23 |
| 2427.0 | 8.2 |
| 2428.0 | 8.16 |
| 2429.0 | 8.12 |
| 2430.0 | 8.08 |
| 2431.0 | 8.05 |
| 2432.0 | 8.04 |
| 2433.0 | 8.04 |
| 2434.0 | 8.03 |
| 2435.0 | 7.99 |
| 2436.0 | 7.957 |
| 2437.0 | 7.92 |
| 2438.0 | 7.948 |
| 2439.0 | 8 |
| 2440.0 | 8.01 |
| 2441.0 | 8.01 |
| 2442.0 | 7.985 |
| 2443.0 | 7.941 |
| 2444.0 | 7.844 |
| 2445.0 | 7.771 |
| 2446.0 | 7.701 |
| 2447.0 | 7.67 |
| 2448.0 | 7.6 |
| 2449.0 | 7.486 |
| 2450.0 | 7.38 |
| 2451.0 | 7.286 |
| 2452.0 | 7.211 |
| 2453.0 | 7.125 |
| 2454.0 | 7.038 |
| 2455.0 | 6.977 |
| 2456.0 | 6.924 |
| 2457.0 | 6.874 |
| 2458.0 | 6.846 |
| 2459.0 | 6.854 |
| 2460.0 | 6.852 |
| 2461.0 | 6.841 |
| 2462.0 | 6.805 |
| 2463.0 | 6.764 |
| 2464.0 | 6.706 |
| 2465.0 | 6.61 |
| 2466.0 | 6.528 |
| 2467.0 | 6.467 |
| 2468.0 | 6.412 |
| 2469.0 | 6.381 |
| 2470.0 | 6.357 |
| 2471.0 | 6.344 |
| 2472.0 | 6.351 |
| 2473.0 | 6.455 |
| 2474.0 | 6.664 |
| 2475.0 | 6.835 |
| 2476.0 | 6.954 |
| 2477.0 | 7.029 |
| 2478.0 | 7.082 |
| 2479.0 | 7.142 |
| 2480.0 | 7.224 |
| 2481.0 | 7.304 |
| 2482.0 | 7.446 |
| 2483.0 | 7.536 |
| 2484.0 | 7.637 |
| 2485.0 | 8.18 |
| 2486.0 | 8.11 |
| 2487.0 | 8.05 |
| 2488.0 | 8.14 |
| 2489.0 | 8.29 |
| 2490.0 | 8.48 |
| 2491.0 | 8.63 |
| 2492.0 | 8.74 |
| 2493.0 | 8.83 |
| 2494.0 | 8.94 |
| 2495.0 | 9.07 |
| 2496.0 | 9.18 |
| 2497.0 | 9.32 |
| 2498.0 | 9.48 |
| 2499.0 | 9.62 |
| 2500.0 | 9.71 |
| 2501.0 | 9.73 |
| 2502.0 | 9.64 |
| 2503.0 | 9.54 |
| 2504.0 | 9.51 |
| 2505.0 | 9.49 |
| 2506.0 | 9.47 |
| 2507.0 | 9.39 |
| 2508.0 | 9.31 |
| 2509.0 | 9.24 |
| 2510.0 | 9.14 |
| 2511.0 | 9.05 |
| 2512.0 | 8.98 |
| 2513.0 | 8.87 |
| 2514.0 | 8.78 |
| 2515.0 | 8.7 |
| 2516.0 | 8.63 |
| 2517.0 | 8.57 |
| 2518.0 | 8.53 |
| 2519.0 | 8.52 |
| 2520.0 | 8.48 |
| 2521.0 | 8.42 |
| 2522.0 | 8.38 |
| 2523.0 | 8.34 |
| 2524.0 | 8.35 |
| 2525.0 | 8.44 |
| 2526.0 | 8.48 |
| 2527.0 | 8.46 |
| 2528.0 | 8.41 |
| 2529.0 | 8.36 |
| 2530.0 | 8.29 |
| 2531.0 | 8.23 |
| 2532.0 | 8.16 |
| 2533.0 | 8.09 |
| 2534.0 | 8.03 |
| 2535.0 | 7.96 |
| 2536.0 | 7.893 |
| 2537.0 | 7.81 |
| 2538.0 | 7.684 |
| 2539.0 | 7.54 |
| 2540.0 | 7.433 |
| 2541.0 | 7.376 |
| 2542.0 | 7.309 |
| 2543.0 | 7.251 |
| 2544.0 | 7.184 |
| 2545.0 | 7.082 |
| 2546.0 | 6.992 |
| 2547.0 | 6.915 |
| 2548.0 | 6.841 |
| 2549.0 | 6.776 |
| 2550.0 | 6.697 |
| 2551.0 | 6.63 |
| 2552.0 | 6.567 |
| 2553.0 | 6.501 |
| 2554.0 | 6.434 |
| 2555.0 | 6.385 |
| 2556.0 | 6.328 |
| 2557.0 | 6.243 |
| 2558.0 | 6.192 |
| 2559.0 | 6.155 |
| 2560.0 | 6.101 |
| 2561.0 | 6.04 |
| 2562.0 | 5.98 |
| 2563.0 | 6.113 |
| 2564.0 | 5.909 |
| 2565.0 | 5.854 |
| 2566.0 | 5.853 |
| 2567.0 | 5.846 |
| 2568.0 | 5.877 |
| 2569.0 | 5.997 |
| 2570.0 | 6.206 |
| 2571.0 | 6.394 |
| 2572.0 | 6.523 |
| 2573.0 | 6.62 |
| 2574.0 | 6.691 |
| 2575.0 | 6.765 |
| 2576.0 | 6.85 |
| 2577.0 | 6.935 |
| 2578.0 | 7.05 |
| 2579.0 | 7.139 |
| 2580.0 | 7.232 |
| 2581.0 | 7.476 |
| 2582.0 | 7.558 |
| 2583.0 | 7.656 |
| 2584.0 | 7.783 |
| 2585.0 | 7.922 |
| 2586.0 | 8.06 |
| 2587.0 | 8.25 |
| 2588.0 | 8.42 |
| 2589.0 | 8.57 |
| 2590.0 | 8.69 |
| 2591.0 | 8.79 |
| 2592.0 | 8.9 |
| 2593.0 | 9.01 |
| 2594.0 | 9.13 |
| 2595.0 | 9.17 |
| 2596.0 | 9.17 |
| 2597.0 | 9.26 |
| 2598.0 | 9.35 |
| 2599.0 | 9.43 |
| 2600.0 | 9.53 |
| 2601.0 | 9.6 |
| 2602.0 | 9.74 |
| 2603.0 | 9.69 |
| 2604.0 | 9.43 |
| 2605.0 | 9.26 |
| 2606.0 | 9.21 |
| 2607.0 | 9.13 |
| 2608.0 | 8.98 |
| 2609.0 | 8.84 |
| 2610.0 | 8.73 |
| 2611.0 | 8.64 |
| 2612.0 | 8.56 |
| 2613.0 | 8.47 |
| 2614.0 | 8.39 |
| 2615.0 | 8.34 |
| 2616.0 | 8.39 |
| 2617.0 | 8.45 |
| 2618.0 | 8.49 |
| 2619.0 | 8.51 |
| 2620.0 | 8.47 |
| 2621.0 | 8.38 |
| 2622.0 | 8.33 |
| 2623.0 | 8.33 |
| 2624.0 | 8.29 |
| 2625.0 | 8.23 |
| 2626.0 | 8.15 |
| 2627.0 | 8.06 |
| 2628.0 | 7.925 |
| 2629.0 | 7.808 |
| 2630.0 | 7.69 |
| 2631.0 | 7.585 |
| 2632.0 | 7.503 |
| 2633.0 | 7.413 |
| 2634.0 | 7.327 |
| 2635.0 | 7.287 |
| 2636.0 | 7.229 |
| 2637.0 | 7.115 |
| 2638.0 | 7.03 |
| 2639.0 | 6.966 |
| 2640.0 | 6.897 |
| 2641.0 | 6.841 |
| 2642.0 | 6.782 |
| 2643.0 | 6.741 |
| 2644.0 | 6.704 |
| 2645.0 | 6.665 |
| 2646.0 | 6.601 |
| 2647.0 | 6.507 |
| 2648.0 | 6.42 |
| 2649.0 | 6.351 |
| 2650.0 | 6.304 |
| 2651.0 | 6.244 |
| 2652.0 | 6.171 |
| 2653.0 | 6.102 |
| 2654.0 | 6.051 |
| 2655.0 | 6.075 |
| 2656.0 | 6.132 |
| 2657.0 | 6.121 |
| 2658.0 | 6.083 |
| 2659.0 | 6.028 |
| 2660.0 | 6.005 |
| 2661.0 | 6.02 |
| 2662.0 | 6.086 |
| 2663.0 | 6.197 |
| 2664.0 | 6.275 |
| 2665.0 | 6.289 |
| 2666.0 | 6.4 |
| 2667.0 | 6.59 |
| 2668.0 | 6.788 |
| 2669.0 | 6.91 |
| 2670.0 | 6.786 |
| 2671.0 | 6.786 |
| 2672.0 | 6.873 |
| 2673.0 | 7.135 |
| 2674.0 | 7.295 |
| 2675.0 | 7.427 |
| 2676.0 | 7.666 |
| 2677.0 | 7.839 |
| 2678.0 | 8.11 |
| 2679.0 | 8.27 |
| 2680.0 | 8.41 |
| 2681.0 | 8.55 |
| 2682.0 | 8.63 |
| 2683.0 | 8.64 |
| 2684.0 | 8.71 |
| 2685.0 | 8.8 |
| 2686.0 | 8.83 |
| 2687.0 | 8.85 |
| 2688.0 | 9.07 |
| 2689.0 | 9.36 |
| 2690.0 | 9.66 |
| 2691.0 | 9.76 |
| 2692.0 | 9.84 |
| 2693.0 | 10.01 |
| 2694.0 | 10.06 |
| 2695.0 | 9.67 |
| 2696.0 | 9.6 |
| 2697.0 | 9.53 |
| 2698.0 | 9.43 |
| 2699.0 | 9.32 |
| 2700.0 | 9.11 |
| 2701.0 | 8.75 |
| 2702.0 | 8.65 |
| 2703.0 | 8.55 |
| 2704.0 | 8.46 |
| 2705.0 | 8.39 |
| 2706.0 | 8.32 |
| 2707.0 | 8.26 |
| 2708.0 | 8.19 |
| 2709.0 | 8.12 |
| 2710.0 | 8.07 |
| 2711.0 | 7.998 |
| 2712.0 | 7.956 |
| 2713.0 | 7.912 |
| 2714.0 | 7.851 |
| 2715.0 | 7.808 |
| 2716.0 | 7.796 |
| 2717.0 | 7.783 |
| 2718.0 | 7.771 |
| 2719.0 | 7.755 |
| 2720.0 | 7.739 |
| 2721.0 | 7.704 |
| 2722.0 | 7.679 |
| 2723.0 | 7.659 |
| 2724.0 | 7.635 |
| 2725.0 | 7.608 |
| 2726.0 | 7.58 |
| 2727.0 | 7.533 |
| 2728.0 | 7.512 |
| 2729.0 | 7.488 |
| 2730.0 | 7.457 |
| 2731.0 | 7.432 |
| 2732.0 | 7.414 |
| 2733.0 | 7.38 |
| 2734.0 | 7.355 |
| 2735.0 | 7.329 |
| 2736.0 | 7.31 |
| 2737.0 | 7.292 |
| 2738.0 | 7.273 |
| 2739.0 | 7.253 |
| 2740.0 | 7.234 |
| 2741.0 | 7.22 |
| 2742.0 | 7.212 |
| 2743.0 | 7.2 |
| 2744.0 | 7.184 |
| 2745.0 | 7.163 |
| 2746.0 | 7.153 |
| 2747.0 | 7.125 |
| 2748.0 | 7.109 |
| 2749.0 | 7.092 |
| 2750.0 | 7.06 |
| 2751.0 | 7.03 |
| 2752.0 | 7.014 |
| 2753.0 | 6.992 |
| 2754.0 | 6.977 |
| 2755.0 | 6.959 |
| 2756.0 | 6.949 |
| 2757.0 | 6.936 |
| 2758.0 | 6.922 |
| 2759.0 | 6.929 |
| 2760.0 | 6.931 |
| 2761.0 | 6.944 |
| 2762.0 | 6.955 |
| 2763.0 | 6.97 |
| 2764.0 | 7.006 |
| 2765.0 | 7.033 |
| 2766.0 | 7.05 |
| 2767.0 | 7.09 |
| 2768.0 | 7.115 |
| 2769.0 | 7.137 |
| 2770.0 | 7.189 |
| 2771.0 | 7.2 |
| 2772.0 | 7.283 |
| 2773.0 | 7.339 |
| 2774.0 | 7.387 |
| 2775.0 | 7.407 |
| 2776.0 | 7.398 |
| 2777.0 | 7.423 |
| 2778.0 | 7.445 |
| 2779.0 | 7.475 |
| 2780.0 | 7.551 |
| 2781.0 | 7.577 |
| 2782.0 | 7.647 |
| 2783.0 | 7.701 |
| 2784.0 | 7.73 |
| 2785.0 | 7.8 |
| 2786.0 | 7.82 |
| 2787.0 | 7.813 |
| 2788.0 | 7.832 |
| 2789.0 | 7.839 |
| 2790.0 | 7.864 |
| 2791.0 | 7.857 |
| 2792.0 | 7.872 |
| 2793.0 | 7.885 |
| 2794.0 | 7.853 |
| 2795.0 | 7.821 |
| 2796.0 | 7.772 |
| 2797.0 | 7.728 |
| 2798.0 | 7.681 |
| 2799.0 | 7.635 |
| 2800.0 | 7.584 |
| 2801.0 | 7.53 |
| 2802.0 | 7.46 |
| 2803.0 | 7.385 |
| 2804.0 | 7.31 |
| 2805.0 | 7.255 |
| 2806.0 | 7.179 |
| 2807.0 | 7.117 |
| 2808.0 | 7.067 |
| 2809.0 | 6.997 |
| 2810.0 | 6.92 |
| 2811.0 | 6.868 |
| 2812.0 | 6.8 |
| 2813.0 | 6.725 |
| 2814.0 | 6.659 |
| 2815.0 | 6.602 |
| 2816.0 | 6.543 |
| 2817.0 | 6.472 |
| 2818.0 | 6.417 |
| 2819.0 | 6.357 |
| 2820.0 | 6.297 |
| 2821.0 | 6.238 |
| 2822.0 | 6.17 |
| 2823.0 | 6.113 |
| 2824.0 | 6.056 |
| 2825.0 | 6.055 |
| 2826.0 | 6.026 |
| 2827.0 | 5.99 |
| 2828.0 | 5.986 |
| 2829.0 | 5.965 |
| 2830.0 | 5.968 |
| 2831.0 | 5.928 |
| 2832.0 | 5.879 |
| 2833.0 | 5.824 |
| 2834.0 | 5.776 |
| 2835.0 | 5.725 |
| 2836.0 | 5.66 |
| 2837.0 | 5.618 |
| 2838.0 | 5.565 |
| 2839.0 | 5.528 |
| 2840.0 | 5.469 |
| 2841.0 | 5.39 |
| 2842.0 | 5.337 |
| 2843.0 | 5.342 |
| 2844.0 | 5.298 |
| 2845.0 | 5.242 |
| 2846.0 | 5.195 |
| 2847.0 | 5.126 |
| 2848.0 | 5.09 |
| 2849.0 | 5.048 |
| 2850.0 | 5.045 |
| 2851.0 | 5.016 |
| 2852.0 | 5.005 |
| 2853.0 | 4.999 |
| 2854.0 | 5.009 |
| 2855.0 | 5.051 |
| 2856.0 | 5.073 |
| 2857.0 | 5.115 |
| 2858.0 | 5.179 |
| 2859.0 | 5.224 |
| 2860.0 | 5.291 |
| 2861.0 | 5.34 |
| 2862.0 | 5.392 |
| 2863.0 | 5.426 |
| 2864.0 | 5.469 |
| 2865.0 | 5.548 |
| 2866.0 | 5.625 |
| 2867.0 | 5.682 |
| 2868.0 | 5.74 |
| 2869.0 | 5.816 |
| 2870.0 | 5.903 |
| 2871.0 | 5.985 |
| 2872.0 | 6.072 |
| 2873.0 | 6.185 |
| 2874.0 | 6.292 |
| 2875.0 | 6.405 |
| 2876.0 | 6.524 |
| 2877.0 | 6.638 |
| 2878.0 | 6.769 |
| 2879.0 | 6.875 |
| 2880.0 | 6.998 |
| 2881.0 | 7.139 |
| 2882.0 | 7.241 |
| 2883.0 | 7.375 |
| 2884.0 | 7.494 |
| 2885.0 | 7.515 |
| 2886.0 | 7.556 |
| 2887.0 | 7.583 |
| 2888.0 | 7.619 |
| 2889.0 | 7.602 |
| 2890.0 | 7.593 |
| 2891.0 | 7.575 |
| 2892.0 | 7.536 |
| 2893.0 | 7.512 |
| 2894.0 | 7.445 |
| 2895.0 | 7.401 |
| 2896.0 | 7.356 |
| 2897.0 | 7.318 |
| 2898.0 | 7.283 |
| 2899.0 | 7.253 |
| 2900.0 | 7.229 |
| 2901.0 | 7.19 |
| 2902.0 | 7.158 |
| 2903.0 | 7.122 |
| 2904.0 | 7.087 |
| 2905.0 | 7.055 |
| 2906.0 | 7.014 |
| 2907.0 | 6.974 |
| 2908.0 | 6.925 |
| 2909.0 | 6.9 |
| 2910.0 | 6.858 |
| 2911.0 | 6.808 |
| 2912.0 | 6.765 |
| 2913.0 | 6.714 |
| 2914.0 | 6.669 |
| 2915.0 | 6.628 |
| 2916.0 | 6.581 |
| 2917.0 | 6.548 |
| 2918.0 | 6.508 |
| 2919.0 | 6.458 |
| 2920.0 | 6.422 |
| 2921.0 | 6.391 |
| 2922.0 | 6.367 |
| 2923.0 | 6.332 |
| 2924.0 | 6.317 |
| 2925.0 | 6.305 |
| 2926.0 | 6.28 |
| 2927.0 | 6.266 |
| 2928.0 | 6.247 |
| 2929.0 | 6.215 |
| 2930.0 | 6.198 |
| 2931.0 | 6.171 |
| 2932.0 | 6.13 |
| 2933.0 | 6.093 |
| 2934.0 | 6.069 |
| 2935.0 | 6.026 |
| 2936.0 | 5.99 |
| 2937.0 | 5.969 |
| 2938.0 | 5.931 |
| 2939.0 | 5.923 |
| 2940.0 | 5.904 |
| 2941.0 | 5.878 |
| 2942.0 | 5.855 |
| 2943.0 | 5.821 |
| 2944.0 | 5.804 |
| 2945.0 | 5.779 |
| 2946.0 | 5.756 |
| 2947.0 | 5.698 |
| 2948.0 | 5.68 |
| 2949.0 | 5.646 |
| 2950.0 | 5.651 |
| 2951.0 | 5.642 |
| 2952.0 | 5.646 |
| 2953.0 | 5.67 |
| 2954.0 | 5.698 |
| 2955.0 | 5.722 |
| 2956.0 | 5.732 |
| 2957.0 | 5.772 |
| 2958.0 | 5.81 |
| 2959.0 | 5.856 |
| 2960.0 | 5.899 |
| 2961.0 | 5.972 |
| 2962.0 | 6.06 |
| 2963.0 | 6.131 |
| 2964.0 | 6.242 |
| 2965.0 | 6.338 |
| 2966.0 | 6.456 |
| 2967.0 | 6.548 |
| 2968.0 | 6.655 |
| 2969.0 | 6.78 |
| 2970.0 | 6.903 |
| 2971.0 | 7.007 |
| 2972.0 | 7.147 |
| 2973.0 | 7.255 |
| 2974.0 | 7.38 |
| 2975.0 | 7.494 |
| 2976.0 | 7.604 |
| 2977.0 | 7.72 |
| 2978.0 | 7.804 |
| 2979.0 | 7.889 |
| 2980.0 | 7.97 |
| 2981.0 | 8.01 |
| 2982.0 | 8.05 |
| 2983.0 | 8.12 |
| 2984.0 | 8.18 |
| 2985.0 | 8.2 |
| 2986.0 | 8.19 |
| 2987.0 | 8.17 |
| 2988.0 | 8.17 |
| 2989.0 | 8.18 |
| 2990.0 | 8.15 |
| 2991.0 | 8.11 |
| 2992.0 | 8.06 |
| 2993.0 | 8.02 |
| 2994.0 | 7.974 |
| 2995.0 | 7.924 |
| 2996.0 | 7.873 |
| 2997.0 | 7.832 |
| 2998.0 | 7.779 |
| 2999.0 | 7.743 |
| 3000.0 | 7.707 |
| 3001.0 | 7.689 |
| 3002.0 | 7.654 |
| 3003.0 | 7.611 |
| 3004.0 | 7.582 |
| 3005.0 | 7.555 |
| 3006.0 | 7.507 |
| 3007.0 | 7.454 |
| 3008.0 | 7.407 |
| 3009.0 | 7.358 |
| 3010.0 | 7.315 |
| 3011.0 | 7.27 |
| 3012.0 | 7.23 |
| 3013.0 | 7.182 |
| 3014.0 | 7.13 |
| 3015.0 | 7.094 |
| 3016.0 | 7.044 |
| 3017.0 | 7.012 |
| 3018.0 | 6.984 |
| 3019.0 | 6.95 |
| 3020.0 | 6.93 |
| 3021.0 | 6.921 |
| 3022.0 | 6.908 |
| 3023.0 | 6.894 |
| 3024.0 | 6.898 |
| 3025.0 | 6.9 |
| 3026.0 | 6.898 |
| 3027.0 | 6.914 |
| 3028.0 | 6.931 |
| 3029.0 | 6.942 |
| 3030.0 | 6.952 |
| 3031.0 | 6.948 |
| 3032.0 | 6.954 |
| 3033.0 | 6.972 |
| 3034.0 | 6.978 |
| 3035.0 | 6.982 |
| 3036.0 | 6.986 |
| 3037.0 | 6.984 |
| 3038.0 | 6.965 |
| 3039.0 | 6.945 |
| 3040.0 | 6.921 |
| 3041.0 | 6.902 |
| 3042.0 | 6.884 |
| 3043.0 | 6.863 |
| 3044.0 | 6.848 |
| 3045.0 | 6.842 |
| 3046.0 | 6.841 |
| 3047.0 | 6.848 |
| 3048.0 | 6.862 |
| 3049.0 | 6.885 |
| 3050.0 | 6.92 |
| 3051.0 | 6.958 |
| 3052.0 | 7.016 |
| 3053.0 | 7.036 |
| 3054.0 | 7.107 |
| 3055.0 | 7.265 |
| 3056.0 | 7.329 |
| 3057.0 | 7.421 |
| 3058.0 | 7.456 |
| 3059.0 | 7.598 |
| 3060.0 | 7.632 |
| 3061.0 | 7.713 |
| 3062.0 | 7.812 |
| 3063.0 | 7.809 |
| 3064.0 | 7.775 |
| 3065.0 | 7.797 |
| 3066.0 | 7.846 |
| 3067.0 | 7.906 |
| 3068.0 | 8.01 |
| 3069.0 | 8.02 |
| 3070.0 | 8.04 |
| 3071.0 | 8.09 |
| 3072.0 | 8.14 |
| 3073.0 | 8.16 |
| 3074.0 | 8.17 |
| 3075.0 | 8.16 |
| 3076.0 | 8.17 |
| 3077.0 | 8.18 |
| 3078.0 | 8.19 |
| 3079.0 | 8.21 |
| 3080.0 | 8.18 |
| 3081.0 | 8.15 |
| 3082.0 | 8.12 |
| 3083.0 | 8.1 |
| 3084.0 | 8.08 |
| 3085.0 | 8.05 |
| 3086.0 | 8 |
| 3087.0 | 7.955 |
| 3088.0 | 7.908 |
| 3089.0 | 7.867 |
| 3090.0 | 7.828 |
| 3091.0 | 7.782 |
| 3092.0 | 7.737 |
| 3093.0 | 7.695 |
| 3094.0 | 7.634 |
| 3095.0 | 7.57 |
| 3096.0 | 7.512 |
| 3097.0 | 7.459 |
| 3098.0 | 7.428 |
| 3099.0 | 7.381 |
| 3100.0 | 7.324 |
| 3101.0 | 7.271 |
| 3102.0 | 7.235 |
| 3103.0 | 7.202 |
| 3104.0 | 7.16 |
| 3105.0 | 7.112 |
| 3106.0 | 7.064 |
| 3107.0 | 7.026 |
| 3108.0 | 6.994 |
| 3109.0 | 6.957 |
| 3110.0 | 6.893 |
| 3111.0 | 6.836 |
| 3112.0 | 6.769 |
| 3113.0 | 6.696 |
| 3114.0 | 6.629 |
| 3115.0 | 6.557 |
| 3116.0 | 6.49 |
| 3117.0 | 6.423 |
| 3118.0 | 6.357 |
| 3119.0 | 6.295 |
| 3120.0 | 6.232 |
| 3121.0 | 6.168 |
| 3122.0 | 6.106 |
| 3123.0 | 6.05 |
| 3124.0 | 5.998 |
| 3125.0 | 5.936 |
| 3126.0 | 5.887 |
| 3127.0 | 5.836 |
| 3128.0 | 5.786 |
| 3129.0 | 5.73 |
| 3130.0 | 5.682 |
| 3131.0 | 5.631 |
| 3132.0 | 5.587 |
| 3133.0 | 5.535 |
| 3134.0 | 5.477 |
| 3135.0 | 5.417 |
| 3136.0 | 5.361 |
| 3137.0 | 5.315 |
| 3138.0 | 5.273 |
| 3139.0 | 5.246 |
| 3140.0 | 5.219 |
| 3141.0 | 5.203 |
| 3142.0 | 5.195 |
| 3143.0 | 5.201 |
| 3144.0 | 5.214 |
| 3145.0 | 5.232 |
| 3146.0 | 5.254 |
| 3147.0 | 5.302 |
| 3148.0 | 5.356 |
| 3149.0 | 5.406 |
| 3150.0 | 5.474 |
| 3151.0 | 5.539 |
| 3152.0 | 5.592 |
| 3153.0 | 5.647 |
| 3154.0 | 5.717 |
| 3155.0 | 5.791 |
| 3156.0 | 5.864 |
| 3157.0 | 5.937 |
| 3158.0 | 6.03 |
| 3159.0 | 6.094 |
| 3160.0 | 6.155 |
| 3161.0 | 6.224 |
| 3162.0 | 6.29 |
| 3163.0 | 6.347 |
| 3164.0 | 6.409 |
| 3165.0 | 6.465 |
| 3166.0 | 6.522 |
| 3167.0 | 6.582 |
| 3168.0 | 6.666 |
| 3169.0 | 6.737 |
| 3170.0 | 6.783 |
| 3171.0 | 6.851 |
| 3172.0 | 6.886 |
| 3173.0 | 6.91 |
| 3174.0 | 6.948 |
| 3175.0 | 6.978 |
| 3176.0 | 7.011 |
| 3177.0 | 7.01 |
| 3178.0 | 6.991 |
| 3179.0 | 6.978 |
| 3180.0 | 6.976 |
| 3181.0 | 6.98 |
| 3182.0 | 6.967 |
| 3183.0 | 6.95 |
| 3184.0 | 6.933 |
| 3185.0 | 6.919 |
| 3186.0 | 6.907 |
| 3187.0 | 6.881 |
| 3188.0 | 6.837 |
| 3189.0 | 6.799 |
| 3190.0 | 6.744 |
| 3191.0 | 6.686 |
| 3192.0 | 6.628 |
| 3193.0 | 6.558 |
| 3194.0 | 6.486 |
| 3195.0 | 6.417 |
| 3196.0 | 6.351 |
| 3197.0 | 6.29 |
| 3198.0 | 6.223 |
| 3199.0 | 6.16 |
| 3200.0 | 6.104 |
| 3201.0 | 6.043 |
| 3202.0 | 5.973 |
| 3203.0 | 5.909 |
| 3204.0 | 5.847 |
| 3205.0 | 5.78 |
| 3206.0 | 5.711 |
| 3207.0 | 5.648 |
| 3208.0 | 5.584 |
| 3209.0 | 5.517 |
| 3210.0 | 5.456 |
| 3211.0 | 5.399 |
| 3212.0 | 5.336 |
| 3213.0 | 5.282 |
| 3214.0 | 5.225 |
| 3215.0 | 5.171 |
| 3216.0 | 5.114 |
| 3217.0 | 5.061 |
| 3218.0 | 5.002 |
| 3219.0 | 4.952 |
| 3220.0 | 4.898 |
| 3221.0 | 4.847 |
| 3222.0 | 4.795 |
| 3223.0 | 4.748 |
| 3224.0 | 4.699 |
| 3225.0 | 4.653 |
| 3226.0 | 4.605 |
| 3227.0 | 4.566 |
| 3228.0 | 4.52 |
| 3229.0 | 4.485 |
| 3230.0 | 4.44 |
| 3231.0 | 4.403 |
| 3232.0 | 4.361 |
| 3233.0 | 4.327 |
| 3234.0 | 4.286 |
| 3235.0 | 4.256 |
| 3236.0 | 4.224 |
| 3237.0 | 4.197 |
| 3238.0 | 4.191 |
| 3239.0 | 4.17 |
| 3240.0 | 4.177 |
| 3241.0 | 4.197 |
| 3242.0 | 4.234 |
| 3243.0 | 4.279 |
| 3244.0 | 4.326 |
| 3245.0 | 4.379 |
| 3246.0 | 4.439 |
| 3247.0 | 4.481 |
| 3248.0 | 4.521 |
| 3249.0 | 4.585 |
| 3250.0 | 4.648 |
| 3251.0 | 4.727 |
| 3252.0 | 4.794 |
| 3253.0 | 4.861 |
| 3254.0 | 4.927 |
| 3255.0 | 5.014 |
| 3256.0 | 5.071 |
| 3257.0 | 5.185 |
| 3258.0 | 5.301 |
| 3259.0 | 5.415 |
| 3260.0 | 5.556 |
| 3261.0 | 5.679 |
| 3262.0 | 5.797 |
| 3263.0 | 5.951 |
| 3264.0 | 6.052 |
| 3265.0 | 6.144 |
| 3266.0 | 6.243 |
| 3267.0 | 6.315 |
| 3268.0 | 6.383 |
| 3269.0 | 6.443 |
| 3270.0 | 6.504 |
| 3271.0 | 6.554 |
| 3272.0 | 6.577 |
| 3273.0 | 6.603 |
| 3274.0 | 6.636 |
| 3275.0 | 6.64 |
| 3276.0 | 6.621 |
| 3277.0 | 6.608 |
| 3278.0 | 6.58 |
| 3279.0 | 6.56 |
| 3280.0 | 6.536 |
| 3281.0 | 6.517 |
| 3282.0 | 6.487 |
| 3283.0 | 6.462 |
| 3284.0 | 6.442 |
| 3285.0 | 6.416 |
| 3286.0 | 6.39 |
| 3287.0 | 6.362 |
| 3288.0 | 6.344 |
| 3289.0 | 6.328 |
| 3290.0 | 6.308 |
| 3291.0 | 6.296 |
| 3292.0 | 6.289 |
| 3293.0 | 6.283 |
| 3294.0 | 6.291 |
| 3295.0 | 6.301 |
| 3296.0 | 6.306 |
| 3297.0 | 6.314 |
| 3298.0 | 6.321 |
| 3299.0 | 6.319 |
| 3300.0 | 6.32 |
| 3301.0 | 6.309 |
| 3302.0 | 6.303 |
| 3303.0 | 6.285 |
| 3304.0 | 6.261 |
| 3305.0 | 6.249 |
| 3306.0 | 6.222 |
| 3307.0 | 6.186 |
| 3308.0 | 6.149 |
| 3309.0 | 6.108 |
| 3310.0 | 6.064 |
| 3311.0 | 6.015 |
| 3312.0 | 5.975 |
| 3313.0 | 5.927 |
| 3314.0 | 5.879 |
| 3315.0 | 5.83 |
| 3316.0 | 5.785 |
| 3317.0 | 5.745 |
| 3318.0 | 5.702 |
| 3319.0 | 5.656 |
| 3320.0 | 5.606 |
| 3321.0 | 5.567 |
| 3322.0 | 5.52 |
| 3323.0 | 5.474 |
| 3324.0 | 5.431 |
| 3325.0 | 5.387 |
| 3326.0 | 5.348 |
| 3327.0 | 5.305 |
| 3328.0 | 5.263 |
| 3329.0 | 5.226 |
| 3330.0 | 5.192 |
| 3331.0 | 5.153 |
| 3332.0 | 5.117 |
| 3333.0 | 5.087 |
| 3334.0 | 5.054 |
| 3335.0 | 5.042 |
| 3336.0 | 5.049 |
| 3337.0 | 5.065 |
| 3338.0 | 5.091 |
| 3339.0 | 5.151 |
| 3340.0 | 5.199 |
| 3341.0 | 5.235 |
| 3342.0 | 5.292 |
| 3343.0 | 5.357 |
| 3344.0 | 5.414 |
| 3345.0 | 5.467 |
| 3346.0 | 5.522 |
| 3347.0 | 5.563 |
| 3348.0 | 5.605 |
| 3349.0 | 5.666 |
| 3350.0 | 5.739 |
| 3351.0 | 5.825 |
| 3352.0 | 5.908 |
| 3353.0 | 6.021 |
| 3354.0 | 6.157 |
| 3355.0 | 6.287 |
| 3356.0 | 6.417 |
| 3357.0 | 6.551 |
| 3358.0 | 6.685 |
| 3359.0 | 6.81 |
| 3360.0 | 6.939 |
| 3361.0 | 7.055 |
| 3362.0 | 7.162 |
| 3363.0 | 7.232 |
| 3364.0 | 7.273 |
| 3365.0 | 7.321 |
| 3366.0 | 7.369 |
| 3367.0 | 7.396 |
| 3368.0 | 7.41 |
| 3369.0 | 7.397 |
| 3370.0 | 7.368 |
| 3371.0 | 7.343 |
| 3372.0 | 7.302 |
| 3373.0 | 7.258 |
| 3374.0 | 7.223 |
| 3375.0 | 7.176 |
| 3376.0 | 7.128 |
| 3377.0 | 7.089 |
| 3378.0 | 7.046 |
| 3379.0 | 7.007 |
| 3380.0 | 6.962 |
| 3381.0 | 6.92 |
| 3382.0 | 6.875 |
| 3383.0 | 6.831 |
| 3384.0 | 6.789 |
| 3385.0 | 6.747 |
| 3386.0 | 6.701 |
| 3387.0 | 6.661 |
| 3388.0 | 6.617 |
| 3389.0 | 6.568 |
| 3390.0 | 6.52 |
| 3391.0 | 6.479 |
| 3392.0 | 6.437 |
| 3393.0 | 6.391 |
| 3394.0 | 6.35 |
| 3395.0 | 6.315 |
| 3396.0 | 6.275 |
| 3397.0 | 6.223 |
| 3398.0 | 6.184 |
| 3399.0 | 6.14 |
| 3400.0 | 6.097 |
| 3401.0 | 6.056 |
| 3402.0 | 6.015 |
| 3403.0 | 5.97 |
| 3404.0 | 5.932 |
| 3405.0 | 5.885 |
| 3406.0 | 5.839 |
| 3407.0 | 5.79 |
| 3408.0 | 5.748 |
| 3409.0 | 5.703 |
| 3410.0 | 5.657 |
| 3411.0 | 5.61 |
| 3412.0 | 5.566 |
| 3413.0 | 5.522 |
| 3414.0 | 5.481 |
| 3415.0 | 5.437 |
| 3416.0 | 5.392 |
| 3417.0 | 5.356 |
| 3418.0 | 5.317 |
| 3419.0 | 5.278 |
| 3420.0 | 5.223 |
| 3421.0 | 5.184 |
| 3422.0 | 5.141 |
| 3423.0 | 5.099 |
| 3424.0 | 5.055 |
| 3425.0 | 5.011 |
| 3426.0 | 4.967 |
| 3427.0 | 4.929 |
| 3428.0 | 4.887 |
| 3429.0 | 4.849 |
| 3430.0 | 4.82 |
| 3431.0 | 4.792 |
| 3432.0 | 4.767 |
| 3433.0 | 4.745 |
| 3434.0 | 4.733 |
| 3435.0 | 4.763 |
| 3436.0 | 4.796 |
| 3437.0 | 4.818 |
| 3438.0 | 4.839 |
| 3439.0 | 4.868 |
| 3440.0 | 4.911 |
| 3441.0 | 4.944 |
| 3442.0 | 4.984 |
| 3443.0 | 5.02 |
| 3444.0 | 5.068 |
| 3445.0 | 5.14 |
| 3446.0 | 5.22 |
| 3447.0 | 5.301 |
| 3448.0 | 5.389 |
| 3449.0 | 5.51 |
| 3450.0 | 5.661 |
| 3451.0 | 5.798 |
| 3452.0 | 5.942 |
| 3453.0 | 6.086 |
| 3454.0 | 6.231 |
| 3455.0 | 6.382 |
| 3456.0 | 6.519 |
| 3457.0 | 6.648 |
| 3458.0 | 6.759 |
| 3459.0 | 6.834 |
| 3460.0 | 6.892 |
| 3461.0 | 6.954 |
| 3462.0 | 6.996 |
| 3463.0 | 7.005 |
| 3464.0 | 7.013 |
| 3465.0 | 7.003 |
| 3466.0 | 6.986 |
| 3467.0 | 6.956 |
| 3468.0 | 6.916 |
| 3469.0 | 6.861 |
| 3470.0 | 6.811 |
| 3471.0 | 6.752 |
| 3472.0 | 6.693 |
| 3473.0 | 6.643 |
| 3474.0 | 6.594 |
| 3475.0 | 6.545 |
| 3476.0 | 6.496 |
| 3477.0 | 6.445 |
| 3478.0 | 6.397 |
| 3479.0 | 6.351 |
| 3480.0 | 6.306 |
| 3481.0 | 6.256 |
| 3482.0 | 6.211 |
| 3483.0 | 6.157 |
| 3484.0 | 6.11 |
| 3485.0 | 6.07 |
| 3486.0 | 6.023 |
| 3487.0 | 5.979 |
| 3488.0 | 5.933 |
| 3489.0 | 5.888 |
| 3490.0 | 5.837 |
| 3491.0 | 5.798 |
| 3492.0 | 5.758 |
| 3493.0 | 5.709 |
| 3494.0 | 5.669 |
| 3495.0 | 5.628 |
| 3496.0 | 5.591 |
| 3497.0 | 5.55 |
| 3498.0 | 5.507 |
| 3499.0 | 5.461 |
| 3500.0 | 5.428 |
| 3501.0 | 5.387 |
| 3502.0 | 5.348 |
| 3503.0 | 5.307 |
| 3504.0 | 5.265 |
| 3505.0 | 5.226 |
| 3506.0 | 5.185 |
| 3507.0 | 5.156 |
| 3508.0 | 5.127 |
| 3509.0 | 5.097 |
| 3510.0 | 5.061 |
| 3511.0 | 5.029 |
| 3512.0 | 4.993 |
| 3513.0 | 4.953 |
| 3514.0 | 4.918 |
| 3515.0 | 4.889 |
| 3516.0 | 4.858 |
| 3517.0 | 4.808 |
| 3518.0 | 4.779 |
| 3519.0 | 4.703 |
| 3520.0 | 4.666 |
| 3521.0 | 4.663 |
| 3522.0 | 4.622 |
| 3523.0 | 4.587 |
| 3524.0 | 4.578 |
| 3525.0 | 4.549 |
| 3526.0 | 4.517 |
| 3527.0 | 4.501 |
| 3528.0 | 4.488 |
| 3529.0 | 4.47 |
| 3530.0 | 4.462 |
| 3531.0 | 4.493 |
| 3532.0 | 4.539 |
| 3533.0 | 4.584 |
| 3534.0 | 4.617 |
| 3535.0 | 4.656 |
| 3536.0 | 4.704 |
| 3537.0 | 4.747 |
| 3538.0 | 4.79 |
| 3539.0 | 4.837 |
| 3540.0 | 4.898 |
| 3541.0 | 4.975 |
| 3542.0 | 5.058 |
| 3543.0 | 5.16 |
| 3544.0 | 5.256 |
| 3545.0 | 5.388 |
| 3546.0 | 5.543 |
| 3547.0 | 5.703 |
| 3548.0 | 5.854 |
| 3549.0 | 6.029 |
| 3550.0 | 6.207 |
| 3551.0 | 6.372 |
| 3552.0 | 6.555 |
| 3553.0 | 6.717 |
| 3554.0 | 6.845 |
| 3555.0 | 6.972 |
| 3556.0 | 7.053 |
| 3557.0 | 7.109 |
| 3558.0 | 7.174 |
| 3559.0 | 7.234 |
| 3560.0 | 7.255 |
| 3561.0 | 7.27 |
| 3562.0 | 7.276 |
| 3563.0 | 7.272 |
| 3564.0 | 7.247 |
| 3565.0 | 7.216 |
| 3566.0 | 7.173 |
| 3567.0 | 7.131 |
| 3568.0 | 7.101 |
| 3569.0 | 7.069 |
| 3570.0 | 7.022 |
| 3571.0 | 6.992 |
| 3572.0 | 6.951 |
| 3573.0 | 6.924 |
| 3574.0 | 6.911 |
| 3575.0 | 6.89 |
| 3576.0 | 6.86 |
| 3577.0 | 6.845 |
| 3578.0 | 6.832 |
| 3579.0 | 6.81 |
| 3580.0 | 6.796 |
| 3581.0 | 6.789 |
| 3582.0 | 6.808 |
| 3583.0 | 6.838 |
| 3584.0 | 6.858 |
| 3585.0 | 6.878 |
| 3586.0 | 6.894 |
| 3587.0 | 6.889 |
| 3588.0 | 6.867 |
| 3589.0 | 6.848 |
| 3590.0 | 6.822 |
| 3591.0 | 6.799 |
| 3592.0 | 6.766 |
| 3593.0 | 6.738 |
| 3594.0 | 6.742 |
| 3595.0 | 6.75 |
| 3596.0 | 6.769 |
| 3597.0 | 6.833 |
| 3598.0 | 6.904 |
| 3599.0 | 6.966 |
| 3600.0 | 6.975 |
| 3601.0 | 6.99 |
| 3602.0 | 7.017 |
| 3603.0 | 7.062 |
| 3604.0 | 7.089 |
| 3605.0 | 7.05 |
| 3606.0 | 7.041 |
| 3607.0 | 7.032 |
| 3608.0 | 7.034 |
| 3609.0 | 7.033 |
| 3610.0 | 7.032 |
| 3611.0 | 7.054 |
| 3612.0 | 7.082 |
| 3613.0 | 7.078 |
| 3614.0 | 7.074 |
| 3615.0 | 7.074 |
| 3616.0 | 7.071 |
| 3617.0 | 7.073 |
| 3618.0 | 7.077 |
| 3619.0 | 7.074 |
| 3620.0 | 7.072 |
| 3621.0 | 7.062 |
| 3622.0 | 7.053 |
| 3623.0 | 7.04 |
| 3624.0 | 7.043 |
| 3625.0 | 7.043 |
| 3626.0 | 7.045 |
| 3627.0 | 7.044 |
| 3628.0 | 7.035 |
| 3629.0 | 7.025 |
| 3630.0 | 7.007 |
| 3631.0 | 7.005 |
| 3632.0 | 6.996 |
| 3633.0 | 6.985 |
| 3634.0 | 6.985 |
| 3635.0 | 6.99 |
| 3636.0 | 6.982 |
| 3637.0 | 6.981 |
| 3638.0 | 6.975 |
| 3639.0 | 6.988 |
| 3640.0 | 6.994 |
| 3641.0 | 7.008 |
| 3642.0 | 7.01 |
| 3643.0 | 7.013 |
| 3644.0 | 7.045 |
| 3645.0 | 7.104 |
| 3646.0 | 7.151 |
| 3647.0 | 7.171 |
| 3648.0 | 7.207 |
| 3649.0 | 7.246 |
| 3650.0 | 7.258 |
| 3651.0 | 7.296 |
| 3652.0 | 7.338 |
| 3653.0 | 7.352 |
| 3654.0 | 7.336 |
| 3655.0 | 7.335 |
| 3656.0 | 7.329 |
| 3657.0 | 7.319 |
| 3658.0 | 7.303 |
| 3659.0 | 7.285 |
| 3660.0 | 7.268 |
| 3661.0 | 7.239 |
| 3662.0 | 7.202 |
| 3663.0 | 7.166 |
| 3664.0 | 7.128 |
| 3665.0 | 7.086 |
| 3666.0 | 7.047 |
| 3667.0 | 6.995 |
| 3668.0 | 6.944 |
| 3669.0 | 6.911 |
| 3670.0 | 6.866 |
| 3671.0 | 6.815 |
| 3672.0 | 6.758 |
| 3673.0 | 6.693 |
| 3674.0 | 6.622 |
| 3675.0 | 6.555 |
| 3676.0 | 6.482 |
| 3677.0 | 6.415 |
| 3678.0 | 6.346 |
| 3679.0 | 6.276 |
| 3680.0 | 6.212 |
| 3681.0 | 6.158 |
| 3682.0 | 6.098 |
| 3683.0 | 6.031 |
| 3684.0 | 5.971 |
| 3685.0 | 5.916 |
| 3686.0 | 5.849 |
| 3687.0 | 5.783 |
| 3688.0 | 5.721 |
| 3689.0 | 5.657 |
| 3690.0 | 5.606 |
| 3691.0 | 5.555 |
| 3692.0 | 5.506 |
| 3693.0 | 5.461 |
| 3694.0 | 5.42 |
| 3695.0 | 5.398 |
| 3696.0 | 5.379 |
| 3697.0 | 5.372 |
| 3698.0 | 5.366 |
| 3699.0 | 5.363 |
| 3700.0 | 5.367 |
| 3701.0 | 5.356 |
| 3702.0 | 5.342 |
| 3703.0 | 5.331 |
| 3704.0 | 5.305 |
| 3705.0 | 5.273 |
| 3706.0 | 5.241 |
| 3707.0 | 5.195 |
| 3708.0 | 5.157 |
| 3709.0 | 5.12 |
| 3710.0 | 5.09 |
| 3711.0 | 5.054 |
| 3712.0 | 5.019 |
| 3713.0 | 4.981 |
| 3714.0 | 4.932 |
| 3715.0 | 4.881 |
| 3716.0 | 4.837 |
| 3717.0 | 4.795 |
| 3718.0 | 4.746 |
| 3719.0 | 4.715 |
| 3720.0 | 4.678 |
| 3721.0 | 4.645 |
| 3722.0 | 4.617 |
| 3723.0 | 4.599 |
| 3724.0 | 4.616 |
| 3725.0 | 4.62 |
| 3726.0 | 4.622 |
| 3727.0 | 4.64 |
| 3728.0 | 4.662 |
| 3729.0 | 4.692 |
| 3730.0 | 4.719 |
| 3731.0 | 4.746 |
| 3732.0 | 4.772 |
| 3733.0 | 4.822 |
| 3734.0 | 4.888 |
| 3735.0 | 4.98 |
| 3736.0 | 5.047 |
| 3737.0 | 5.153 |
| 3738.0 | 5.296 |
| 3739.0 | 5.433 |
| 3740.0 | 5.563 |
| 3741.0 | 5.692 |
| 3742.0 | 5.821 |
| 3743.0 | 5.938 |
| 3744.0 | 6.058 |
| 3745.0 | 6.173 |
| 3746.0 | 6.262 |
| 3747.0 | 6.327 |
| 3748.0 | 6.399 |
| 3749.0 | 6.491 |
| 3750.0 | 6.581 |
| 3751.0 | 6.638 |
| 3752.0 | 6.675 |
| 3753.0 | 6.702 |
| 3754.0 | 6.727 |
| 3755.0 | 6.739 |
| 3756.0 | 6.719 |
| 3757.0 | 6.691 |
| 3758.0 | 6.684 |
| 3759.0 | 6.648 |
| 3760.0 | 6.628 |
| 3761.0 | 6.608 |
| 3762.0 | 6.578 |
| 3763.0 | 6.546 |
| 3764.0 | 6.514 |
| 3765.0 | 6.49 |
| 3766.0 | 6.457 |
| 3767.0 | 6.433 |
| 3768.0 | 6.421 |
| 3769.0 | 6.405 |
| 3770.0 | 6.397 |
| 3771.0 | 6.387 |
| 3772.0 | 6.376 |
| 3773.0 | 6.377 |
| 3774.0 | 6.374 |
| 3775.0 | 6.371 |
| 3776.0 | 6.371 |
| 3777.0 | 6.364 |
| 3778.0 | 6.365 |
| 3779.0 | 6.356 |
| 3780.0 | 6.356 |
| 3781.0 | 6.354 |
| 3782.0 | 6.357 |
| 3783.0 | 6.361 |
| 3784.0 | 6.364 |
| 3785.0 | 6.369 |
| 3786.0 | 6.374 |
| 3787.0 | 6.379 |
| 3788.0 | 6.385 |
| 3789.0 | 6.395 |
| 3790.0 | 6.394 |
| 3791.0 | 6.394 |
| 3792.0 | 6.4 |
| 3793.0 | 6.407 |
| 3794.0 | 6.41 |
| 3795.0 | 6.418 |
| 3796.0 | 6.42 |
| 3797.0 | 6.43 |
| 3798.0 | 6.434 |
| 3799.0 | 6.444 |
| 3800.0 | 6.456 |
| 3801.0 | 6.456 |
| 3802.0 | 6.462 |
| 3803.0 | 6.472 |
| 3804.0 | 6.487 |
| 3805.0 | 6.491 |
| 3806.0 | 6.504 |
| 3807.0 | 6.512 |
| 3808.0 | 6.52 |
| 3809.0 | 6.535 |
| 3810.0 | 6.542 |
| 3811.0 | 6.548 |
| 3812.0 | 6.56 |
| 3813.0 | 6.56 |
| 3814.0 | 6.57 |
| 3815.0 | 6.579 |
| 3816.0 | 6.589 |
| 3817.0 | 6.609 |
| 3818.0 | 6.627 |
| 3819.0 | 6.655 |
| 3820.0 | 6.679 |
| 3821.0 | 6.707 |
| 3822.0 | 6.753 |
| 3823.0 | 6.811 |
| 3824.0 | 6.887 |
| 3825.0 | 6.969 |
| 3826.0 | 7.007 |
| 3827.0 | 7.039 |
| 3828.0 | 7.1 |
| 3829.0 | 7.164 |
| 3830.0 | 7.225 |
| 3831.0 | 7.282 |
| 3832.0 | 7.347 |
| 3833.0 | 7.391 |
| 3834.0 | 7.46 |
| 3835.0 | 7.583 |
| 3836.0 | 7.689 |
| 3837.0 | 7.787 |
| 3838.0 | 7.882 |
| 3839.0 | 7.99 |
| 3840.0 | 8.08 |
| 3841.0 | 8.14 |
| 3842.0 | 8.16 |
| 3843.0 | 8.16 |
| 3844.0 | 8.17 |
| 3845.0 | 8.18 |
| 3846.0 | 8.18 |
| 3847.0 | 8.18 |
| 3848.0 | 8.17 |
| 3849.0 | 8.16 |
| 3850.0 | 8.15 |
| 3851.0 | 8.13 |
| 3852.0 | 8.11 |
| 3853.0 | 8.11 |
| 3854.0 | 8.08 |
| 3855.0 | 8.05 |
| 3856.0 | 8.02 |
| 3857.0 | 8 |
| 3858.0 | 7.976 |
| 3859.0 | 7.952 |
| 3860.0 | 7.928 |
| 3861.0 | 7.907 |
| 3862.0 | 7.876 |
| 3863.0 | 7.854 |
| 3864.0 | 7.827 |
| 3865.0 | 7.811 |
| 3866.0 | 7.786 |
| 3867.0 | 7.761 |
| 3868.0 | 7.738 |
| 3869.0 | 7.716 |
| 3870.0 | 7.695 |
| 3871.0 | 7.666 |
| 3872.0 | 7.639 |
| 3873.0 | 7.611 |
| 3874.0 | 7.58 |
| 3875.0 | 7.559 |
| 3876.0 | 7.535 |
| 3877.0 | 7.518 |
| 3878.0 | 7.498 |
| 3879.0 | 7.479 |
| 3880.0 | 7.467 |
| 3881.0 | 7.447 |
| 3882.0 | 7.435 |
| 3883.0 | 7.426 |
| 3884.0 | 7.414 |
| 3885.0 | 7.398 |
| 3886.0 | 7.387 |
| 3887.0 | 7.381 |
| 3888.0 | 7.368 |
| 3889.0 | 7.357 |
| 3890.0 | 7.341 |
| 3891.0 | 7.337 |
| 3892.0 | 7.325 |
| 3893.0 | 7.312 |
| 3894.0 | 7.301 |
| 3895.0 | 7.293 |
| 3896.0 | 7.285 |
| 3897.0 | 7.276 |
| 3898.0 | 7.269 |
| 3899.0 | 7.265 |
| 3900.0 | 7.255 |
| 3901.0 | 7.246 |
| 3902.0 | 7.236 |
| 3903.0 | 7.236 |
| 3904.0 | 7.23 |
| 3905.0 | 7.223 |
| 3906.0 | 7.219 |
| 3907.0 | 7.21 |
| 3908.0 | 7.203 |
| 3909.0 | 7.2 |
| 3910.0 | 7.195 |
| 3911.0 | 7.197 |
| 3912.0 | 7.199 |
| 3913.0 | 7.204 |
| 3914.0 | 7.211 |
| 3915.0 | 7.217 |
| 3916.0 | 7.232 |
| 3917.0 | 7.254 |
| 3918.0 | 7.284 |
| 3919.0 | 7.324 |
| 3920.0 | 7.35 |
| 3921.0 | 7.373 |
| 3922.0 | 7.411 |
| 3923.0 | 7.44 |
| 3924.0 | 7.482 |
| 3925.0 | 7.518 |
| 3926.0 | 7.568 |
| 3927.0 | 7.619 |
| 3928.0 | 7.665 |
| 3929.0 | 7.707 |
| 3930.0 | 7.754 |
| 3931.0 | 7.806 |
| 3932.0 | 7.847 |
| 3933.0 | 7.881 |
| 3934.0 | 7.944 |
| 3935.0 | 7.98 |
| 3936.0 | 8.03 |
| 3937.0 | 8.09 |
| 3938.0 | 8.14 |
| 3939.0 | 8.17 |
| 3940.0 | 8.17 |
| 3941.0 | 8.2 |
| 3942.0 | 8.22 |
| 3943.0 | 8.23 |
| 3944.0 | 8.24 |
| 3945.0 | 8.24 |
| 3946.0 | 8.24 |
| 3947.0 | 8.22 |
| 3948.0 | 8.19 |
| 3949.0 | 8.16 |
| 3950.0 | 8.1 |
| 3951.0 | 8.05 |
| 3952.0 | 7.996 |
| 3953.0 | 7.927 |
| 3954.0 | 7.853 |
| 3955.0 | 7.78 |
| 3956.0 | 7.707 |
| 3957.0 | 7.637 |
| 3958.0 | 7.562 |
| 3959.0 | 7.485 |
| 3960.0 | 7.411 |
| 3961.0 | 7.344 |
| 3962.0 | 7.281 |
| 3963.0 | 7.228 |
| 3964.0 | 7.181 |
| 3965.0 | 7.154 |
| 3966.0 | 7.126 |
| 3967.0 | 7.116 |
| 3968.0 | 7.114 |
| 3969.0 | 7.113 |
| 3970.0 | 7.122 |
| 3971.0 | 7.128 |
| 3972.0 | 7.133 |
| 3973.0 | 7.138 |
| 3974.0 | 7.135 |
| 3975.0 | 7.137 |
| 3976.0 | 7.135 |
| 3977.0 | 7.142 |
| 3978.0 | 7.148 |
| 3979.0 | 7.153 |
| 3980.0 | 7.155 |
| 3981.0 | 7.159 |
| 3982.0 | 7.161 |
| 3983.0 | 7.156 |
| 3984.0 | 7.15 |
| 3985.0 | 7.147 |
| 3986.0 | 7.141 |
| 3987.0 | 7.14 |
| 3988.0 | 7.142 |
| 3989.0 | 7.141 |
| 3990.0 | 7.143 |
| 3991.0 | 7.139 |
| 3992.0 | 7.138 |
| 3993.0 | 7.135 |
| 3994.0 | 7.132 |
| 3995.0 | 7.13 |
| 3996.0 | 7.13 |
| 3997.0 | 7.123 |
| 3998.0 | 7.119 |
| 3999.0 | 7.106 |
| 4000.0 | 7.1 |
| 4001.0 | 7.092 |
| 4002.0 | 7.09 |
| 4003.0 | 7.073 |
| 4004.0 | 7.06 |
| 4005.0 | 7.049 |
| 4006.0 | 7.043 |
| 4007.0 | 7.044 |
| 4008.0 | 7.041 |
| 4009.0 | 7.038 |
| 4010.0 | 7.047 |
| 4011.0 | 7.076 |
| 4012.0 | 7.097 |
| 4013.0 | 7.097 |
| 4014.0 | 7.102 |
| 4015.0 | 7.119 |
| 4016.0 | 7.146 |
| 4017.0 | 7.172 |
| 4018.0 | 7.19 |
| 4019.0 | 7.219 |
| 4020.0 | 7.235 |
| 4021.0 | 7.259 |
| 4022.0 | 7.296 |
| 4023.0 | 7.317 |
| 4024.0 | 7.339 |
| 4025.0 | 7.362 |
| 4026.0 | 7.377 |
| 4027.0 | 7.397 |
| 4028.0 | 7.419 |
| 4029.0 | 7.462 |
| 4030.0 | 7.494 |
| 4031.0 | 7.537 |
| 4032.0 | 7.573 |
| 4033.0 | 7.61 |
| 4034.0 | 7.625 |
| 4035.0 | 7.618 |
| 4036.0 | 7.633 |
| 4037.0 | 7.647 |
| 4038.0 | 7.639 |
| 4039.0 | 7.629 |
| 4040.0 | 7.623 |
| 4041.0 | 7.629 |
| 4042.0 | 7.633 |
| 4043.0 | 7.621 |
| 4044.0 | 7.595 |
| 4045.0 | 7.566 |
| 4046.0 | 7.542 |
| 4047.0 | 7.526 |
| 4048.0 | 7.502 |
| 4049.0 | 7.497 |
| 4050.0 | 7.486 |
| 4051.0 | 7.482 |
| 4052.0 | 7.479 |
| 4053.0 | 7.463 |
| 4054.0 | 7.467 |
| 4055.0 | 7.475 |
| 4056.0 | 7.479 |
| 4057.0 | 7.473 |
| 4058.0 | 7.461 |
| 4059.0 | 7.456 |
| 4060.0 | 7.435 |
| 4061.0 | 7.409 |
| 4062.0 | 7.387 |
| 4063.0 | 7.35 |
| 4064.0 | 7.309 |
| 4065.0 | 7.272 |
| 4066.0 | 7.252 |
| 4067.0 | 7.226 |
| 4068.0 | 7.185 |
| 4069.0 | 7.144 |
| 4070.0 | 7.098 |
| 4071.0 | 7.059 |
| 4072.0 | 7.006 |
| 4073.0 | 6.958 |
| 4074.0 | 6.905 |
| 4075.0 | 6.852 |
| 4076.0 | 6.805 |
| 4077.0 | 6.762 |
| 4078.0 | 6.727 |
| 4079.0 | 6.701 |
| 4080.0 | 6.681 |
| 4081.0 | 6.668 |
| 4082.0 | 6.654 |
| 4083.0 | 6.642 |
| 4084.0 | 6.654 |
| 4085.0 | 6.673 |
| 4086.0 | 6.676 |
| 4087.0 | 6.663 |
| 4088.0 | 6.646 |
| 4089.0 | 6.64 |
| 4090.0 | 6.631 |
| 4091.0 | 6.624 |
| 4092.0 | 6.618 |
| 4093.0 | 6.614 |
| 4094.0 | 6.607 |
| 4095.0 | 6.612 |
| 4096.0 | 6.612 |
| 4097.0 | 6.599 |
| 4098.0 | 6.587 |
| 4099.0 | 6.579 |
| 4100.0 | 6.565 |
| 4101.0 | 6.552 |
| 4102.0 | 6.541 |
| 4103.0 | 6.521 |
| 4104.0 | 6.486 |
| 4105.0 | 6.46 |
| 4106.0 | 6.447 |
| 4107.0 | 6.458 |
| 4108.0 | 6.472 |
| 4109.0 | 6.489 |
| 4110.0 | 6.493 |
| 4111.0 | 6.511 |
| 4112.0 | 6.574 |
| 4113.0 | 6.569 |
| 4114.0 | 6.565 |
| 4115.0 | 6.57 |
| 4116.0 | 6.585 |
| 4117.0 | 6.57 |
| 4118.0 | 6.573 |
| 4119.0 | 6.602 |
| 4120.0 | 6.639 |
| 4121.0 | 6.657 |
| 4122.0 | 6.662 |
| 4123.0 | 6.681 |
| 4124.0 | 6.775 |
| 4125.0 | 6.821 |
| 4126.0 | 6.834 |
| 4127.0 | 6.863 |
| 4128.0 | 6.903 |
| 4129.0 | 6.915 |
| 4130.0 | 6.925 |
| 4131.0 | 6.933 |
| 4132.0 | 6.936 |
| 4133.0 | 6.92 |
| 4134.0 | 6.886 |
| 4135.0 | 6.861 |
| 4136.0 | 6.853 |
| 4137.0 | 6.847 |
| 4138.0 | 6.817 |
| 4139.0 | 6.771 |
| 4140.0 | 6.718 |
| 4141.0 | 6.673 |
| 4142.0 | 6.609 |
| 4143.0 | 6.559 |
| 4144.0 | 6.524 |
| 4145.0 | 6.475 |
| 4146.0 | 6.415 |
| 4147.0 | 6.356 |
| 4148.0 | 6.299 |
| 4149.0 | 6.246 |
| 4150.0 | 6.189 |
| 4151.0 | 6.108 |
| 4152.0 | 6.047 |
| 4153.0 | 5.988 |
| 4154.0 | 5.936 |
| 4155.0 | 5.889 |
| 4156.0 | 5.841 |
| 4157.0 | 5.798 |
| 4158.0 | 5.751 |
| 4159.0 | 5.695 |
| 4160.0 | 5.646 |
| 4161.0 | 5.583 |
| 4162.0 | 5.533 |
| 4163.0 | 5.492 |
| 4164.0 | 5.453 |
| 4165.0 | 5.426 |
| 4166.0 | 5.392 |
| 4167.0 | 5.362 |
| 4168.0 | 5.345 |
| 4169.0 | 5.324 |
| 4170.0 | 5.312 |
| 4171.0 | 5.293 |
| 4172.0 | 5.287 |
| 4173.0 | 5.262 |
| 4174.0 | 5.232 |
| 4175.0 | 5.205 |
| 4176.0 | 5.159 |
| 4177.0 | 5.122 |
| 4178.0 | 5.098 |
| 4179.0 | 5.078 |
| 4180.0 | 5.056 |
| 4181.0 | 5.04 |
| 4182.0 | 5.031 |
| 4183.0 | 5.007 |
| 4184.0 | 4.989 |
| 4185.0 | 4.979 |
| 4186.0 | 4.961 |
| 4187.0 | 4.935 |
| 4188.0 | 4.887 |
| 4189.0 | 4.836 |
| 4190.0 | 4.783 |
| 4191.0 | 4.749 |
| 4192.0 | 4.724 |
| 4193.0 | 4.685 |
| 4194.0 | 4.663 |
| 4195.0 | 4.629 |
| 4196.0 | 4.602 |
| 4197.0 | 4.581 |
| 4198.0 | 4.559 |
| 4199.0 | 4.548 |
| 4200.0 | 4.551 |
| 4201.0 | 4.56 |
| 4202.0 | 4.578 |
| 4203.0 | 4.601 |
| 4204.0 | 4.624 |
| 4205.0 | 4.674 |
| 4206.0 | 4.727 |
| 4207.0 | 4.773 |
| 4208.0 | 4.804 |
| 4209.0 | 4.826 |
| 4210.0 | 4.874 |
| 4211.0 | 4.943 |
| 4212.0 | 4.989 |
| 4213.0 | 5.028 |
| 4214.0 | 5.092 |
| 4215.0 | 5.13 |
| 4216.0 | 5.145 |
| 4217.0 | 5.229 |
| 4218.0 | 5.28 |
| 4219.0 | 5.351 |
| 4220.0 | 5.426 |
| 4221.0 | 5.483 |
| 4222.0 | 5.524 |
| 4223.0 | 5.568 |
| 4224.0 | 5.609 |
| 4225.0 | 5.64 |
| 4226.0 | 5.658 |
| 4227.0 | 5.655 |
| 4228.0 | 5.671 |
| 4229.0 | 5.672 |
| 4230.0 | 5.652 |
| 4231.0 | 5.646 |
| 4232.0 | 5.631 |
| 4233.0 | 5.628 |
| 4234.0 | 5.63 |
| 4235.0 | 5.621 |
| 4236.0 | 5.614 |
| 4237.0 | 5.604 |
| 4238.0 | 5.58 |
| 4239.0 | 5.55 |
| 4240.0 | 5.521 |
| 4241.0 | 5.483 |
| 4242.0 | 5.452 |
| 4243.0 | 5.409 |
| 4244.0 | 5.376 |
| 4245.0 | 5.332 |
| 4246.0 | 5.296 |
| 4247.0 | 5.257 |
| 4248.0 | 5.218 |
| 4249.0 | 5.174 |
| 4250.0 | 5.133 |
| 4251.0 | 5.098 |
| 4252.0 | 5.042 |
| 4253.0 | 4.976 |
| 4254.0 | 4.905 |
| 4255.0 | 4.833 |
| 4256.0 | 4.758 |
| 4257.0 | 4.683 |
| 4258.0 | 4.612 |
| 4259.0 | 4.55 |
| 4260.0 | 4.482 |
| 4261.0 | 4.415 |
| 4262.0 | 4.353 |
| 4263.0 | 4.294 |
| 4264.0 | 4.235 |
| 4265.0 | 4.18 |
| 4266.0 | 4.123 |
| 4267.0 | 4.066 |
| 4268.0 | 4.025 |
| 4269.0 | 3.967 |
| 4270.0 | 3.916 |
| 4271.0 | 3.872 |
| 4272.0 | 3.842 |
| 4273.0 | 3.818 |
| 4274.0 | 3.788 |
| 4275.0 | 3.763 |
| 4276.0 | 3.744 |
| 4277.0 | 3.732 |
| 4278.0 | 3.708 |
| 4279.0 | 3.705 |
| 4280.0 | 3.712 |
| 4281.0 | 3.717 |
| 4282.0 | 3.71 |
| 4283.0 | 3.718 |
| 4284.0 | 3.724 |
| 4285.0 | 3.734 |
| 4286.0 | 3.74 |
| 4287.0 | 3.744 |
| 4288.0 | 3.742 |
| 4289.0 | 3.743 |
| 4290.0 | 3.709 |
| 4291.0 | 3.681 |
| 4292.0 | 3.648 |
| 4293.0 | 3.618 |
| 4294.0 | 3.578 |
| 4295.0 | 3.554 |
| 4296.0 | 3.543 |
| 4297.0 | 3.526 |
| 4298.0 | 3.516 |
| 4299.0 | 3.491 |
| 4300.0 | 3.472 |
| 4301.0 | 3.477 |
| 4302.0 | 3.493 |
| 4303.0 | 3.502 |
| 4304.0 | 3.516 |
| 4305.0 | 3.537 |
| 4306.0 | 3.56 |
| 4307.0 | 3.579 |
| 4308.0 | 3.588 |
| 4309.0 | 3.635 |
| 4310.0 | 3.683 |
| 4311.0 | 3.731 |
| 4312.0 | 3.784 |
| 4313.0 | 3.876 |
| 4314.0 | 3.988 |
| 4315.0 | 4.102 |
| 4316.0 | 4.204 |
| 4317.0 | 4.311 |
| 4318.0 | 4.428 |
| 4319.0 | 4.528 |
| 4320.0 | 4.644 |
| 4321.0 | 4.716 |
| 4322.0 | 4.77 |
| 4323.0 | 4.828 |
| 4324.0 | 4.894 |
| 4325.0 | 4.95 |
| 4326.0 | 4.996 |
| 4327.0 | 5.024 |
| 4328.0 | 5.024 |
| 4329.0 | 5.026 |
| 4330.0 | 5.029 |
| 4331.0 | 5.014 |
| 4332.0 | 4.984 |
| 4333.0 | 4.946 |
| 4334.0 | 4.906 |
| 4335.0 | 4.885 |
| 4336.0 | 4.862 |
| 4337.0 | 4.845 |
| 4338.0 | 4.831 |
| 4339.0 | 4.83 |
| 4340.0 | 4.813 |
| 4341.0 | 4.799 |
| 4342.0 | 4.815 |
| 4343.0 | 4.813 |
| 4344.0 | 4.817 |
| 4345.0 | 4.83 |
| 4346.0 | 4.841 |
| 4347.0 | 4.829 |
| 4348.0 | 4.824 |
| 4349.0 | 4.833 |
| 4350.0 | 4.83 |
| 4351.0 | 4.805 |
| 4352.0 | 4.808 |
| 4353.0 | 4.824 |
| 4354.0 | 4.838 |
| 4355.0 | 4.853 |
| 4356.0 | 4.874 |
| 4357.0 | 4.896 |
| 4358.0 | 4.922 |
| 4359.0 | 4.949 |
| 4360.0 | 4.959 |
| 4361.0 | 4.973 |
| 4362.0 | 4.994 |
| 4363.0 | 5.013 |
| 4364.0 | 5.028 |
| 4365.0 | 5.041 |
| 4366.0 | 5.048 |
| 4367.0 | 5.063 |
| 4368.0 | 5.071 |
| 4369.0 | 5.076 |
| 4370.0 | 5.084 |
| 4371.0 | 5.099 |
| 4372.0 | 5.114 |
| 4373.0 | 5.131 |
| 4374.0 | 5.136 |
| 4375.0 | 5.138 |
| 4376.0 | 5.146 |
| 4377.0 | 5.138 |
| 4378.0 | 5.122 |
| 4379.0 | 5.11 |
| 4380.0 | 5.101 |
| 4381.0 | 5.076 |
| 4382.0 | 5.061 |
| 4383.0 | 5.063 |
| 4384.0 | 5.068 |
| 4385.0 | 5.073 |
| 4386.0 | 5.063 |
| 4387.0 | 5.061 |
| 4388.0 | 5.071 |
| 4389.0 | 5.08 |
| 4390.0 | 5.09 |
| 4391.0 | 5.102 |
| 4392.0 | 5.122 |
| 4393.0 | 5.157 |
| 4394.0 | 5.188 |
| 4395.0 | 5.228 |
| 4396.0 | 5.279 |
| 4397.0 | 5.344 |
| 4398.0 | 5.415 |
| 4399.0 | 5.461 |
| 4400.0 | 5.492 |
| 4401.0 | 5.517 |
| 4402.0 | 5.555 |
| 4403.0 | 5.599 |
| 4404.0 | 5.664 |
| 4405.0 | 5.762 |
| 4406.0 | 5.878 |
| 4407.0 | 5.952 |
| 4408.0 | 6.031 |
| 4409.0 | 6.109 |
| 4410.0 | 6.171 |
| 4411.0 | 6.253 |
| 4412.0 | 6.311 |
| 4413.0 | 6.359 |
| 4414.0 | 6.424 |
| 4415.0 | 6.523 |
| 4416.0 | 6.568 |
| 4417.0 | 6.608 |
| 4418.0 | 6.627 |
| 4419.0 | 6.652 |
| 4420.0 | 6.683 |
| 4421.0 | 6.728 |
| 4422.0 | 6.714 |
| 4423.0 | 6.721 |
| 4424.0 | 6.695 |
| 4425.0 | 6.669 |
| 4426.0 | 6.628 |
| 4427.0 | 6.591 |
| 4428.0 | 6.532 |
| 4429.0 | 6.482 |
| 4430.0 | 6.422 |
| 4431.0 | 6.357 |
| 4432.0 | 6.301 |
| 4433.0 | 6.248 |
| 4434.0 | 6.19 |
| 4435.0 | 6.121 |
| 4436.0 | 6.056 |
| 4437.0 | 5.992 |
| 4438.0 | 5.928 |
| 4439.0 | 5.888 |
| 4440.0 | 5.844 |
| 4441.0 | 5.804 |
| 4442.0 | 5.763 |
| 4443.0 | 5.731 |
| 4444.0 | 5.696 |
| 4445.0 | 5.665 |
| 4446.0 | 5.629 |
| 4447.0 | 5.593 |
| 4448.0 | 5.546 |
| 4449.0 | 5.5 |
| 4450.0 | 5.455 |
| 4451.0 | 5.406 |
| 4452.0 | 5.357 |
| 4453.0 | 5.313 |
| 4454.0 | 5.288 |
| 4455.0 | 5.258 |
| 4456.0 | 5.225 |
| 4457.0 | 5.18 |
| 4458.0 | 5.164 |
| 4459.0 | 5.164 |
| 4460.0 | 5.16 |
| 4461.0 | 5.159 |
| 4462.0 | 5.165 |
| 4463.0 | 5.173 |
| 4464.0 | 5.181 |
| 4465.0 | 5.191 |
| 4466.0 | 5.206 |
| 4467.0 | 5.217 |
| 4468.0 | 5.23 |
| 4469.0 | 5.245 |
| 4470.0 | 5.258 |
| 4471.0 | 5.266 |
| 4472.0 | 5.265 |
| 4473.0 | 5.274 |
| 4474.0 | 5.283 |
| 4475.0 | 5.273 |
| 4476.0 | 5.271 |
| 4477.0 | 5.275 |
| 4478.0 | 5.255 |
| 4479.0 | 5.239 |
| 4480.0 | 5.22 |
| 4481.0 | 5.19 |
| 4482.0 | 5.16 |
| 4483.0 | 5.137 |
| 4484.0 | 5.11 |
| 4485.0 | 5.078 |
| 4486.0 | 5.039 |
| 4487.0 | 5.013 |
| 4488.0 | 4.999 |
| 4489.0 | 4.991 |
| 4490.0 | 4.985 |
| 4491.0 | 5.003 |
| 4492.0 | 5.039 |
| 4493.0 | 5.099 |
| 4494.0 | 5.157 |
| 4495.0 | 5.224 |
| 4496.0 | 5.278 |
| 4497.0 | 5.356 |
| 4498.0 | 5.443 |
| 4499.0 | 5.506 |
| 4500.0 | 5.564 |
| 4501.0 | 5.626 |
| 4502.0 | 5.707 |
| 4503.0 | 5.819 |
| 4504.0 | 5.87 |
| 4505.0 | 5.912 |
| 4506.0 | 6.018 |
| 4507.0 | 6.109 |
| 4508.0 | 6.167 |
| 4509.0 | 6.221 |
| 4510.0 | 6.302 |
| 4511.0 | 6.387 |
| 4512.0 | 6.456 |
| 4513.0 | 6.52 |
| 4514.0 | 6.578 |
| 4515.0 | 6.628 |
| 4516.0 | 6.663 |
| 4517.0 | 6.709 |
| 4518.0 | 6.757 |
| 4519.0 | 6.79 |
| 4520.0 | 6.811 |
| 4521.0 | 6.824 |
| 4522.0 | 6.836 |
| 4523.0 | 6.833 |
| 4524.0 | 6.832 |
| 4525.0 | 6.812 |
| 4526.0 | 6.794 |
| 4527.0 | 6.771 |
| 4528.0 | 6.749 |
| 4529.0 | 6.728 |
| 4530.0 | 6.696 |
| 4531.0 | 6.669 |
| 4532.0 | 6.627 |
| 4533.0 | 6.594 |
| 4534.0 | 6.551 |
| 4535.0 | 6.514 |
| 4536.0 | 6.48 |
| 4537.0 | 6.448 |
| 4538.0 | 6.408 |
| 4539.0 | 6.363 |
| 4540.0 | 6.31 |
| 4541.0 | 6.265 |
| 4542.0 | 6.226 |
| 4543.0 | 6.183 |
| 4544.0 | 6.148 |
| 4545.0 | 6.11 |
| 4546.0 | 6.072 |
| 4547.0 | 6.028 |
| 4548.0 | 5.989 |
| 4549.0 | 5.945 |
| 4550.0 | 5.9 |
| 4551.0 | 5.865 |
| 4552.0 | 5.82 |
| 4553.0 | 5.775 |
| 4554.0 | 5.738 |
| 4555.0 | 5.705 |
| 4556.0 | 5.667 |
| 4557.0 | 5.629 |
| 4558.0 | 5.59 |
| 4559.0 | 5.555 |
| 4560.0 | 5.504 |
| 4561.0 | 5.465 |
| 4562.0 | 5.427 |
| 4563.0 | 5.385 |
| 4564.0 | 5.333 |
| 4565.0 | 5.287 |
| 4566.0 | 5.239 |
| 4567.0 | 5.181 |
| 4568.0 | 5.129 |
| 4569.0 | 5.085 |
| 4570.0 | 5.038 |
| 4571.0 | 4.995 |
| 4572.0 | 4.943 |
| 4573.0 | 4.896 |
| 4574.0 | 4.851 |
| 4575.0 | 4.809 |
| 4576.0 | 4.772 |
| 4577.0 | 4.73 |
| 4578.0 | 4.695 |
| 4579.0 | 4.661 |
| 4580.0 | 4.627 |
| 4581.0 | 4.592 |
| 4582.0 | 4.543 |
| 4583.0 | 4.512 |
| 4584.0 | 4.483 |
| 4585.0 | 4.454 |
| 4586.0 | 4.432 |
| 4587.0 | 4.411 |
| 4588.0 | 4.398 |
| 4589.0 | 4.386 |
| 4590.0 | 4.4 |
| 4591.0 | 4.439 |
| 4592.0 | 4.467 |
| 4593.0 | 4.497 |
| 4594.0 | 4.527 |
| 4595.0 | 4.554 |
| 4596.0 | 4.592 |
| 4597.0 | 4.659 |
| 4598.0 | 4.73 |
| 4599.0 | 4.793 |
| 4600.0 | 4.841 |
| 4601.0 | 4.956 |
| 4602.0 | 5.085 |
| 4603.0 | 5.212 |
| 4604.0 | 5.323 |
| 4605.0 | 5.424 |
| 4606.0 | 5.539 |
| 4607.0 | 5.656 |
| 4608.0 | 5.754 |
| 4609.0 | 5.828 |
| 4610.0 | 5.91 |
| 4611.0 | 6.005 |
| 4612.0 | 6.113 |
| 4613.0 | 6.2 |
| 4614.0 | 6.258 |
| 4615.0 | 6.321 |
| 4616.0 | 6.353 |
| 4617.0 | 6.361 |
| 4618.0 | 6.368 |
| 4619.0 | 6.34 |
| 4620.0 | 6.292 |
| 4621.0 | 6.268 |
| 4622.0 | 6.231 |
| 4623.0 | 6.194 |
| 4624.0 | 6.152 |
| 4625.0 | 6.099 |
| 4626.0 | 6.057 |
| 4627.0 | 6.005 |
| 4628.0 | 5.963 |
| 4629.0 | 5.903 |
| 4630.0 | 5.839 |
| 4631.0 | 5.783 |
| 4632.0 | 5.728 |
| 4633.0 | 5.671 |
| 4634.0 | 5.62 |
| 4635.0 | 5.569 |
| 4636.0 | 5.517 |
| 4637.0 | 5.475 |
| 4638.0 | 5.422 |
| 4639.0 | 5.38 |
| 4640.0 | 5.332 |
| 4641.0 | 5.287 |
| 4642.0 | 5.244 |
| 4643.0 | 5.193 |
| 4644.0 | 5.147 |
| 4645.0 | 5.105 |
| 4646.0 | 5.051 |
| 4647.0 | 5.005 |
| 4648.0 | 4.967 |
| 4649.0 | 4.932 |
| 4650.0 | 4.905 |
| 4651.0 | 4.881 |
| 4652.0 | 4.863 |
| 4653.0 | 4.826 |
| 4654.0 | 4.789 |
| 4655.0 | 4.747 |
| 4656.0 | 4.702 |
| 4657.0 | 4.661 |
| 4658.0 | 4.619 |
| 4659.0 | 4.58 |
| 4660.0 | 4.537 |
| 4661.0 | 4.5 |
| 4662.0 | 4.457 |
| 4663.0 | 4.414 |
| 4664.0 | 4.382 |
| 4665.0 | 4.339 |
| 4666.0 | 4.301 |
| 4667.0 | 4.265 |
| 4668.0 | 4.224 |
| 4669.0 | 4.196 |
| 4670.0 | 5.388 |
| 4671.0 | 5.449 |
| 4672.0 | 5.508 |
| 4673.0 | 5.55 |
| 4674.0 | 5.581 |
| 4675.0 | 5.593 |
| 4676.0 | 5.6 |
| 4677.0 | 5.614 |
| 4678.0 | 5.636 |
| 4679.0 | 5.629 |
| 4680.0 | 4.389 |
| 4681.0 | 4.197 |
| 4682.0 | 4.336 |
| 4683.0 | 4.826 |
| 4684.0 | 5.414 |
| 4685.0 | 4.817 |
| 4686.0 | 4.937 |
| 4687.0 | 5.015 |
| 4688.0 | 5.095 |
| 4689.0 | 5.168 |
| 4690.0 | 5.227 |
| 4691.0 | 5.306 |
| 4692.0 | 5.379 |
| 4693.0 | 5.456 |
| 4694.0 | 5.523 |
| 4695.0 | 5.571 |
| 4696.0 | 5.599 |
| 4697.0 | 5.64 |
| 4698.0 | 5.681 |
| 4699.0 | 5.737 |
| 4700.0 | 5.792 |
| 4701.0 | 5.859 |
| 4702.0 | 5.911 |
| 4703.0 | 5.934 |
| 4704.0 | 5.935 |
| 4705.0 | 5.925 |
| 4706.0 | 5.904 |
| 4707.0 | 5.882 |
| 4708.0 | 5.877 |
| 4709.0 | 5.876 |
| 4710.0 | 5.869 |
| 4711.0 | 5.861 |
| 4712.0 | 5.856 |
| 4713.0 | 5.861 |
| 4714.0 | 5.86 |
| 4715.0 | 5.868 |
| 4716.0 | 5.866 |
| 4717.0 | 5.867 |
| 4718.0 | 5.879 |
| 4719.0 | 5.886 |
| 4720.0 | 6.032 |
| 4721.0 | 6.566 |
| 4722.0 | 6.575 |
| 4723.0 | 6.592 |
| 4724.0 | 6.623 |
| 4725.0 | 6.667 |
| 4726.0 | 6.701 |
| 4727.0 | 6.722 |
| 4728.0 | 6.753 |
| 4729.0 | 6.787 |
| 4730.0 | 6.806 |
| 4731.0 | 6.806 |
| 4732.0 | 6.793 |
| 4733.0 | 6.784 |
| 4734.0 | 6.787 |
| 4735.0 | 6.783 |
| 4736.0 | 6.776 |
| 4737.0 | 6.763 |
| 4738.0 | 6.709 |
| 4739.0 | 6.652 |
| 4740.0 | 6.579 |
| 4741.0 | 6.496 |
| 4742.0 | 6.409 |
| 4743.0 | 6.33 |
| 4744.0 | 6.252 |
| 4745.0 | 6.173 |
| 4746.0 | 6.098 |
| 4747.0 | 6.026 |
| 4748.0 | 5.946 |
| 4749.0 | 5.867 |
| 4750.0 | 5.793 |
| 4751.0 | 5.732 |
| 4752.0 | 5.656 |
| 4753.0 | 5.591 |
| 4754.0 | 5.52 |
| 4755.0 | 5.458 |
| 4756.0 | 5.381 |
| 4757.0 | 5.321 |
| 4758.0 | 5.262 |
| 4759.0 | 5.201 |
| 4760.0 | 5.145 |
| 4761.0 | 5.09 |
| 4762.0 | 5.028 |
| 4763.0 | 4.976 |
| 4764.0 | 4.918 |
| 4765.0 | 4.862 |
| 4766.0 | 4.801 |
| 4767.0 | 4.742 |
| 4768.0 | 4.686 |
| 4769.0 | 4.623 |
| 4770.0 | 4.573 |
| 4771.0 | 4.525 |
| 4772.0 | 4.473 |
| 4773.0 | 4.42 |
| 4774.0 | 4.373 |
| 4775.0 | 4.325 |
| 4776.0 | 4.26 |
| 4777.0 | 4.226 |
| 4778.0 | 4.185 |
| 4779.0 | 4.145 |
| 4780.0 | 3.591 |
| 4781.0 | 3.331 |
| 4782.0 | 3.375 |
| 4783.0 | 3.419 |
| 4784.0 | 3.467 |
| 4785.0 | 3.514 |
| 4786.0 | 3.555 |
| 4787.0 | 3.636 |
| 4788.0 | 3.746 |
| 4789.0 | 3.842 |
| 4790.0 | 3.935 |
| 4791.0 | 4.04 |
| 4792.0 | 4.138 |
| 4793.0 | 4.229 |
| 4794.0 | 4.309 |
| 4795.0 | 4.384 |
| 4796.0 | 4.459 |
| 4797.0 | 4.541 |
| 4798.0 | 4.628 |
| 4799.0 | 4.686 |
| 4800.0 | 4.726 |
| 4801.0 | 4.737 |
| 4802.0 | 4.719 |
| 4803.0 | 4.689 |
| 4804.0 | 4.653 |
| 4805.0 | 4.607 |
| 4806.0 | 4.568 |
| 4807.0 | 4.523 |
| 4808.0 | 4.48 |
| 4809.0 | 4.442 |
| 4810.0 | 4.405 |
| 4811.0 | 4.36 |
| 4812.0 | 4.314 |
| 4813.0 | 4.275 |
| 4814.0 | 4.235 |
| 4815.0 | 4.198 |
| 4816.0 | 4.166 |
| 4817.0 | 4.123 |
| 4818.0 | 4.091 |
| 4819.0 | 4.051 |
| 4820.0 | 4.014 |
| 4821.0 | 3.978 |
| 4822.0 | 3.943 |
| 4823.0 | 3.911 |
| 4824.0 | 3.881 |
| 4825.0 | 3.847 |
| 4826.0 | 3.815 |
| 4827.0 | 3.782 |
| 4828.0 | 3.75 |
| 4829.0 | 3.725 |
| 4830.0 | 3.695 |
| 4831.0 | 3.67 |
| 4832.0 | 3.638 |
| 4833.0 | 3.615 |
| 4834.0 | 3.585 |
| 4835.0 | 3.563 |
| 4836.0 | 3.537 |
| 4837.0 | 3.519 |
| 4838.0 | 3.502 |
| 4839.0 | 3.495 |
| 4840.0 | 3.5 |
| 4841.0 | 3.51 |
| 4842.0 | 3.531 |
| 4843.0 | 3.548 |
| 4844.0 | 3.559 |
| 4845.0 | 3.577 |
| 4846.0 | 3.583 |
| 4847.0 | 3.59 |
| 4848.0 | 3.596 |
| 4849.0 | 3.601 |
| 4850.0 | 3.604 |
| 4851.0 | 3.602 |
| 4852.0 | 3.597 |
| 4853.0 | 3.601 |
| 4854.0 | 3.614 |
| 4855.0 | 3.615 |
| 4856.0 | 3.629 |
| 4857.0 | 3.64 |
| 4858.0 | 3.644 |
| 4859.0 | 3.662 |
| 4860.0 | 3.673 |
| 4861.0 | 3.682 |
| 4862.0 | 3.694 |
| 4863.0 | 3.708 |
| 4864.0 | 3.728 |
| 4865.0 | 3.731 |
| 4866.0 | 3.746 |
| 4867.0 | 3.765 |
| 4868.0 | 3.794 |
| 4869.0 | 3.846 |
| 4870.0 | 4.229 |
| 4871.0 | 4.351 |
| 4872.0 | 4.423 |
| 4873.0 | 4.493 |
| 4874.0 | 4.562 |
| 4875.0 | 4.637 |
| 4876.0 | 4.705 |
| 4877.0 | 4.773 |
| 4878.0 | 4.827 |
| 4879.0 | 4.871 |
| 4880.0 | 4.917 |
| 4881.0 | 4.974 |
| 4882.0 | 4.891 |
| 4883.0 | 4.403 |
| 4884.0 | 0.444 |
| 4885.0 | 0.416 |
| 4886.0 | 0.401 |
| 4887.0 | 0.397 |
| 4888.0 | 0.362 |
| 4889.0 | 0.346 |
| 4890.0 | 0.296 |
| 4891.0 | 0.276 |
| 4892.0 | 0.245 |
| 4893.0 | 0.281 |
| 4894.0 | 0.352 |
| 4895.0 | 0.401 |
| 4896.0 | 0.431 |
| 4897.0 | 0.441 |
| 4898.0 | 0.427 |
| 4899.0 | 0.396 |
| 4900.0 | 0.358 |
| 4901.0 | 0.346 |
| 4902.0 | 0.347 |
| 4903.0 | 0.329 |
| 4904.0 | 0.29 |
| 4905.0 | 0.236 |
| 4906.0 | 0.18 |
| 4907.0 | 0.126 |
| 4908.0 | 0.076 |
| 4909.0 | 0.036 |
| 4910.0 | -0.013 |
| 4911.0 | -0.046 |
| 4912.0 | -0.067 |
| 4913.0 | -0.088 |
| 4914.0 | -0.079 |
| 4915.0 | -0.07 |
| 4916.0 | -0.065 |
| 4917.0 | -0.061 |
| 4918.0 | -0.06 |
| 4919.0 | -0.062 |
| 4920.0 | -0.064 |
| 4921.0 | -0.06 |
| 4922.0 | -0.058 |
| 4923.0 | -0.055 |
| 4924.0 | -0.039 |
| 4925.0 | -0.049 |
| 4926.0 | -0.046 |
| 4927.0 | -0.044 |
| 4928.0 | -0.045 |
| 4929.0 | -0.043 |
| 4930.0 | -0.041 |
| 4931.0 | -0.043 |
| 4932.0 | -0.045 |
| 4933.0 | -0.051 |
| 4934.0 | -0.05 |
| 4935.0 | -0.049 |
| 4936.0 | -0.048 |
| 4937.0 | -0.054 |
| 4938.0 | -0.054 |
| 4939.0 | -0.053 |
| 4940.0 | -0.05 |
| 4941.0 | -0.048 |
| 4942.0 | -0.051 |
| 4943.0 | -0.049 |
| 4944.0 | -0.05 |
| 4945.0 | -0.048 |
| 4946.0 | -0.048 |
| 4947.0 | -0.054 |
| 4948.0 | -0.043 |
| 4949.0 | -0.049 |
| 4950.0 | -0.05 |
| 4951.0 | -0.051 |
| 4952.0 | -0.048 |
| 4953.0 | -0.045 |
| 4954.0 | -0.045 |
| 4955.0 | -0.047 |
| 4956.0 | -0.045 |
| 4957.0 | -0.048 |
| 4958.0 | -0.043 |
| 4959.0 | -0.045 |
| 4960.0 | -0.05 |
| 4961.0 | -0.046 |
| 4962.0 | -0.046 |
| 4963.0 | -0.041 |
| 4964.0 | -0.04 |
| 4965.0 | -0.047 |
| 4966.0 | -0.048 |
| 4967.0 | -0.051 |
| 4968.0 | -0.044 |
| 4969.0 | -0.043 |
| 4970.0 | 0.93 |
| 4971.0 | 0.934 |
| 4972.0 | 0.943 |
| 4973.0 | 0.956 |
| 4974.0 | -0.044 |
| 4975.0 | -0.048 |
| 4976.0 | -0.044 |
| 4977.0 | -0.038 |
| 4978.0 | -0.038 |
| 4979.0 | -0.043 |
| 4980.0 | -0.047 |
| 4981.0 | -0.047 |
| 4982.0 | -0.036 |
| 4983.0 | -0.042 |
| 4984.0 | -0.039 |
| 4985.0 | -0.038 |
| 4986.0 | -0.035 |
| 4987.0 | -0.033 |
| 4988.0 | -0.038 |
| 4989.0 | -0.04 |
| 4990.0 | -0.038 |
| 4991.0 | -0.043 |
| 4992.0 | -0.046 |
| 4993.0 | -0.041 |
| 4994.0 | 0.182 |
| 4995.0 | 0.199 |
| 4996.0 | 0.211 |
| 4997.0 | 0.222 |
| 4998.0 | 0.245 |
| 4999.0 | 0.256 |
| 5000.0 | 0.279 |
| 5001.0 | 0.305 |
| 5002.0 | 0.32 |
| 5003.0 | 0.347 |
| 5004.0 | 0.368 |
| 5005.0 | 0.406 |
| 5006.0 | 0.432 |
| 5007.0 | 0.455 |
| 5008.0 | 0.486 |
| 5009.0 | 0.514 |
| 5010.0 | 0.557 |
| 5011.0 | 0.589 |
| 5012.0 | 0.628 |
| 5013.0 | 0.663 |
| 5014.0 | 0.693 |
| 5015.0 | 1.254 |
| 5016.0 | 1.263 |
| 5017.0 | 1.281 |
| 5018.0 | 1.288 |
| 5019.0 | 1.308 |
| 5020.0 | 1.312 |
| 5021.0 | 1.317 |
| 5022.0 | 1.33 |
| 5023.0 | 1.34 |
| 5024.0 | 1.353 |
| 5025.0 | 1.364 |
| 5026.0 | 1.389 |
| 5027.0 | 1.413 |
| 5028.0 | 1.427 |
| 5029.0 | 1.461 |
| 5030.0 | 1.486 |
| 5031.0 | 1.527 |
| 5032.0 | 1.561 |
| 5033.0 | 1.591 |
| 5034.0 | 1.607 |
| 5035.0 | 1.635 |
| 5036.0 | 1.644 |
| 5037.0 | 2.742 |
| 5038.0 | 2.799 |
| 5039.0 | 2.826 |
| 5040.0 | 2.842 |
| 5041.0 | 2.859 |
| 5042.0 | 2.878 |
| 5043.0 | 2.877 |
| 5044.0 | 2.85 |
| 5045.0 | 1.899 |
| 5046.0 | 1.888 |
| 5047.0 | 1.881 |
| 5048.0 | 1.871 |
| 5049.0 | 1.862 |
| 5050.0 | 1.882 |
| 5051.0 | 1.927 |
| 5052.0 | 1.97 |
| 5053.0 | 2.016 |
| 5054.0 | 2.058 |
| 5055.0 | 2.107 |
| 5056.0 | 2.158 |
| 5057.0 | 2.208 |
| 5058.0 | 2.256 |
| 5059.0 | 2.299 |
| 5060.0 | 2.345 |
| 5061.0 | 2.383 |
| 5062.0 | 2.415 |
| 5063.0 | 2.448 |
| 5064.0 | 2.475 |
| 5065.0 | 2.481 |
| 5066.0 | 2.501 |
| 5067.0 | 2.507 |
| 5068.0 | 2.517 |
| 5069.0 | 2.523 |
| 5070.0 | 2.526 |
| 5071.0 | 2.526 |
| 5072.0 | 2.526 |
| 5073.0 | 2.521 |
| 5074.0 | 2.524 |
| 5075.0 | 2.522 |
| 5076.0 | 2.517 |
| 5077.0 | 2.516 |
| 5078.0 | 2.505 |
| 5079.0 | 2.5 |
| 5080.0 | 2.498 |
| 5081.0 | 2.491 |
| 5082.0 | 2.481 |
| 5083.0 | 2.471 |
| 5084.0 | 2.472 |
| 5085.0 | 2.471 |
| 5086.0 | 2.463 |
| 5087.0 | 2.46 |
| 5088.0 | 2.459 |
| 5089.0 | 2.458 |
| 5090.0 | 2.459 |
| 5091.0 | 2.466 |
| 5092.0 | 3.575 |
| 5093.0 | 3.683 |
| 5094.0 | 3.892 |
| 5095.0 | 4.428 |
| 5096.0 | 4.48 |
| 5097.0 | 4.505 |
| 5098.0 | 4.558 |
| 5099.0 | 4.59 |
| 5100.0 | 4.624 |
| 5101.0 | 4.684 |
| 5102.0 | 4.741 |
| 5103.0 | 4.77 |
| 5104.0 | 4.84 |
| 5105.0 | 4.789 |
| 5106.0 | 4.794 |
| 5107.0 | 4.93 |
| 5108.0 | 4.942 |
| 5109.0 | -0.033 |
| 5110.0 | -0.036 |
| 5111.0 | -0.034 |
| 5112.0 | -0.032 |
| 5113.0 | -0.034 |
| 5114.0 | -0.037 |
| 5115.0 | -0.037 |
| 5116.0 | -0.037 |
| 5117.0 | -0.032 |
| 5118.0 | -0.034 |
| 5119.0 | -0.035 |
| 5120.0 | -0.023 |
| 5121.0 | -0.028 |
| 5122.0 | -0.034 |
| 5123.0 | -0.04 |
| 5124.0 | -0.036 |
| 5125.0 | -0.035 |
| 5126.0 | -0.042 |
| 5127.0 | -0.038 |
| 5128.0 | -0.037 |
| 5129.0 | -0.03 |
| 5130.0 | -0.027 |
| 5131.0 | -0.023 |
| 5132.0 | -0.034 |
| 5133.0 | -0.036 |
| 5134.0 | -0.038 |
| 5135.0 | -0.04 |
| 5136.0 | 0.02 |
| 5137.0 | 0.47 |
| 5138.0 | 0.763 |
| 5139.0 | 0.876 |
| 5140.0 | 0.963 |
| 5141.0 | 1.019 |
| 5142.0 | 1.072 |
| 5143.0 | 1.105 |
| 5144.0 | 1.233 |
| 5145.0 | 1.953 |
| 5146.0 | 1.977 |
| 5147.0 | 2.026 |
| 5148.0 | 2.064 |
| 5149.0 | 2.108 |
| 5150.0 | 2.152 |
| 5151.0 | 2.183 |
| 5152.0 | 2.217 |
| 5153.0 | 2.273 |
| 5154.0 | 2.312 |
| 5155.0 | 2.359 |
| 5156.0 | 2.718 |
| 5157.0 | 2.764 |
| 5158.0 | 2.797 |
| 5159.0 | 2.83 |
| 5160.0 | 2.858 |
| 5161.0 | 2.884 |
| 5162.0 | 2.894 |
| 5163.0 | 2.902 |
| 5164.0 | 2.923 |
| 5165.0 | 2.96 |
| 5166.0 | 2.969 |
| 5167.0 | 2.975 |
| 5168.0 | 1.667 |
| 5169.0 | 1.679 |
| 5170.0 | 1.695 |
| 5171.0 | 1.71 |
| 5172.0 | 1.731 |
| 5173.0 | 1.757 |
| 5174.0 | 1.8 |
| 5175.0 | 1.845 |
| 5176.0 | 1.892 |
| 5177.0 | 1.939 |
| 5178.0 | 1.975 |
| 5179.0 | 2.01 |
| 5180.0 | 2.049 |
| 5181.0 | 2.093 |
| 5182.0 | 2.148 |
| 5183.0 | 2.195 |
| 5184.0 | 2.23 |
| 5185.0 | 2.273 |
| 5186.0 | 2.297 |
| 5187.0 | 2.318 |
| 5188.0 | 2.318 |
| 5189.0 | 2.309 |
| 5190.0 | 2.315 |
| 5191.0 | 2.78 |
| 5192.0 | 2.828 |
| 5193.0 | 2.898 |
| 5194.0 | 1.07 |
| 5195.0 | 1.086 |
| 5196.0 | 1.092 |
| 5197.0 | 1.098 |
| 5198.0 | 1.121 |
| 5199.0 | 1.645 |
| 5200.0 | 1.658 |
| 5201.0 | 1.697 |
| 5202.0 | 1.714 |
| 5203.0 | 1.729 |
| 5204.0 | 1.743 |
| 5205.0 | 1.792 |
| 5206.0 | -0.03 |
| 5207.0 | -0.026 |
| 5208.0 | -0.029 |
| 5209.0 | -0.028 |
| 5210.0 | -0.028 |
| 5211.0 | -0.031 |
| 5212.0 | -0.029 |
| 5213.0 | -0.02 |
| 5214.0 | -0.007 |
| 5215.0 | -0.011 |
| 5216.0 | 0.284 |
| 5217.0 | 0.333 |
| 5218.0 | 0.358 |
| 5219.0 | 0.371 |
| 5220.0 | 0.401 |
| 5221.0 | 0.423 |
| 5222.0 | 0.465 |
| 5223.0 | 0.511 |
| 5224.0 | 0.538 |
| 5225.0 | 0.576 |
| 5226.0 | 0.62 |
| 5227.0 | 0.671 |
| 5228.0 | 0.7 |
| 5229.0 | 0.731 |
| 5230.0 | 0.787 |
| 5231.0 | 0.835 |
| 5232.0 | 0.867 |
| 5233.0 | -0.077 |
| 5234.0 | -0.05 |
| 5235.0 | -0.043 |
| 5236.0 | -0.037 |
| 5237.0 | -0.022 |
| 5238.0 | -0.037 |
| 5239.0 | -0.038 |
| 5240.0 | -0.038 |
| 5241.0 | -0.028 |
| 5242.0 | -0.044 |
| 5243.0 | -0.07 |
| 5244.0 | -0.047 |
| 5245.0 | -0.038 |
| 5246.0 | -0.036 |
| 5247.0 | -0.028 |
| 5248.0 | -0.032 |
| 5249.0 | -0.031 |
| 5250.0 | -0.033 |
| 5251.0 | -0.031 |
| 5252.0 | -0.03 |
| 5253.0 | -0.025 |
| 5254.0 | -0.025 |
| 5255.0 | -0.028 |
| 5256.0 | -0.027 |
| 5257.0 | -0.03 |
| 5258.0 | -0.029 |
| 5259.0 | -0.027 |
| 5260.0 | -0.022 |
| 5261.0 | -0.026 |
| 5262.0 | -0.025 |
| 5263.0 | -0.026 |
| 5264.0 | -0.027 |
| 5265.0 | -0.023 |